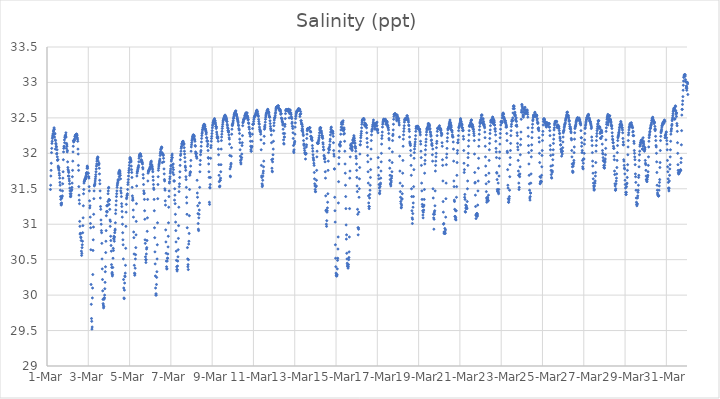
| Category | Salinity (ppt) |
|---|---|
| 44986.166666666664 | 31.49 |
| 44986.177083333336 | 31.55 |
| 44986.1875 | 31.68 |
| 44986.197916666664 | 31.76 |
| 44986.208333333336 | 31.86 |
| 44986.21875 | 32.01 |
| 44986.229166666664 | 32.07 |
| 44986.239583333336 | 32.14 |
| 44986.25 | 32.17 |
| 44986.260416666664 | 32.21 |
| 44986.270833333336 | 32.23 |
| 44986.28125 | 32.25 |
| 44986.291666666664 | 32.27 |
| 44986.302083333336 | 32.28 |
| 44986.3125 | 32.31 |
| 44986.322916666664 | 32.32 |
| 44986.333333333336 | 32.34 |
| 44986.34375 | 32.36 |
| 44986.354166666664 | 32.34 |
| 44986.364583333336 | 32.23 |
| 44986.375 | 32.27 |
| 44986.385416666664 | 32.28 |
| 44986.395833333336 | 32.19 |
| 44986.40625 | 32.06 |
| 44986.416666666664 | 32.18 |
| 44986.427083333336 | 32.14 |
| 44986.4375 | 32.13 |
| 44986.447916666664 | 32.1 |
| 44986.458333333336 | 32.09 |
| 44986.46875 | 31.99 |
| 44986.479166666664 | 32 |
| 44986.489583333336 | 32.05 |
| 44986.5 | 31.95 |
| 44986.510416666664 | 31.9 |
| 44986.520833333336 | 31.91 |
| 44986.53125 | 31.91 |
| 44986.541666666664 | 31.82 |
| 44986.552083333336 | 31.8 |
| 44986.5625 | 31.78 |
| 44986.572916666664 | 31.8 |
| 44986.583333333336 | 31.76 |
| 44986.59375 | 31.72 |
| 44986.604166666664 | 31.69 |
| 44986.614583333336 | 31.65 |
| 44986.625 | 31.59 |
| 44986.635416666664 | 31.55 |
| 44986.645833333336 | 31.48 |
| 44986.65625 | 31.39 |
| 44986.666666666664 | 31.35 |
| 44986.677083333336 | 31.29 |
| 44986.6875 | 31.27 |
| 44986.697916666664 | 31.28 |
| 44986.708333333336 | 31.3 |
| 44986.71875 | 31.37 |
| 44986.729166666664 | 31.39 |
| 44986.739583333336 | 31.4 |
| 44986.75 | 31.47 |
| 44986.760416666664 | 31.57 |
| 44986.770833333336 | 31.65 |
| 44986.78125 | 31.74 |
| 44986.791666666664 | 31.91 |
| 44986.802083333336 | 32.02 |
| 44986.8125 | 32.07 |
| 44986.822916666664 | 32.1 |
| 44986.833333333336 | 32.09 |
| 44986.84375 | 32.19 |
| 44986.854166666664 | 32.15 |
| 44986.864583333336 | 32.23 |
| 44986.875 | 32.22 |
| 44986.885416666664 | 32.25 |
| 44986.895833333336 | 32.24 |
| 44986.90625 | 32.26 |
| 44986.916666666664 | 32.29 |
| 44986.927083333336 | 32.23 |
| 44986.9375 | 32.07 |
| 44986.947916666664 | 32.14 |
| 44986.958333333336 | 32.12 |
| 44986.96875 | 32.1 |
| 44986.979166666664 | 32.02 |
| 44986.989583333336 | 32.04 |
| 44987.0 | 31.88 |
| 44987.010416666664 | 31.8 |
| 44987.020833333336 | 31.77 |
| 44987.03125 | 31.68 |
| 44987.041666666664 | 31.75 |
| 44987.052083333336 | 31.73 |
| 44987.0625 | 31.68 |
| 44987.072916666664 | 31.64 |
| 44987.083333333336 | 31.61 |
| 44987.09375 | 31.57 |
| 44987.104166666664 | 31.51 |
| 44987.114583333336 | 31.47 |
| 44987.125 | 31.43 |
| 44987.135416666664 | 31.39 |
| 44987.145833333336 | 31.39 |
| 44987.15625 | 31.4 |
| 44987.166666666664 | 31.43 |
| 44987.177083333336 | 31.47 |
| 44987.1875 | 31.48 |
| 44987.197916666664 | 31.49 |
| 44987.208333333336 | 31.52 |
| 44987.21875 | 31.58 |
| 44987.229166666664 | 31.67 |
| 44987.239583333336 | 31.76 |
| 44987.25 | 31.89 |
| 44987.260416666664 | 32.02 |
| 44987.270833333336 | 32.1 |
| 44987.28125 | 32.18 |
| 44987.291666666664 | 32.16 |
| 44987.302083333336 | 32.17 |
| 44987.3125 | 32.18 |
| 44987.322916666664 | 32.18 |
| 44987.333333333336 | 32.19 |
| 44987.34375 | 32.21 |
| 44987.354166666664 | 32.24 |
| 44987.364583333336 | 32.24 |
| 44987.375 | 32.25 |
| 44987.385416666664 | 32.26 |
| 44987.395833333336 | 32.26 |
| 44987.40625 | 32.26 |
| 44987.416666666664 | 32.27 |
| 44987.427083333336 | 32.27 |
| 44987.4375 | 32.23 |
| 44987.447916666664 | 32.27 |
| 44987.458333333336 | 32.25 |
| 44987.46875 | 32.22 |
| 44987.479166666664 | 32.2 |
| 44987.489583333336 | 32.17 |
| 44987.5 | 32.06 |
| 44987.510416666664 | 31.99 |
| 44987.520833333336 | 31.83 |
| 44987.53125 | 31.76 |
| 44987.541666666664 | 31.53 |
| 44987.552083333336 | 31.41 |
| 44987.5625 | 31.34 |
| 44987.572916666664 | 31.29 |
| 44987.583333333336 | 31.04 |
| 44987.59375 | 30.97 |
| 44987.604166666664 | 30.86 |
| 44987.614583333336 | 30.87 |
| 44987.625 | 30.87 |
| 44987.635416666664 | 30.82 |
| 44987.645833333336 | 30.81 |
| 44987.65625 | 30.77 |
| 44987.666666666664 | 30.62 |
| 44987.677083333336 | 30.56 |
| 44987.6875 | 30.59 |
| 44987.697916666664 | 30.67 |
| 44987.708333333336 | 30.71 |
| 44987.71875 | 30.76 |
| 44987.729166666664 | 30.88 |
| 44987.739583333336 | 30.98 |
| 44987.75 | 31.09 |
| 44987.760416666664 | 31.26 |
| 44987.770833333336 | 31.43 |
| 44987.78125 | 31.49 |
| 44987.791666666664 | 31.58 |
| 44987.802083333336 | 31.6 |
| 44987.8125 | 31.61 |
| 44987.822916666664 | 31.62 |
| 44987.833333333336 | 31.63 |
| 44987.84375 | 31.64 |
| 44987.854166666664 | 31.64 |
| 44987.864583333336 | 31.66 |
| 44987.875 | 31.64 |
| 44987.885416666664 | 31.67 |
| 44987.895833333336 | 31.69 |
| 44987.90625 | 31.72 |
| 44987.916666666664 | 31.71 |
| 44987.927083333336 | 31.73 |
| 44987.9375 | 31.79 |
| 44987.947916666664 | 31.82 |
| 44987.958333333336 | 31.81 |
| 44987.96875 | 31.79 |
| 44987.979166666664 | 31.72 |
| 44987.989583333336 | 31.72 |
| 44988.0 | 31.72 |
| 44988.010416666664 | 31.67 |
| 44988.020833333336 | 31.67 |
| 44988.03125 | 31.65 |
| 44988.041666666664 | 31.53 |
| 44988.052083333336 | 31.47 |
| 44988.0625 | 31.33 |
| 44988.072916666664 | 31.23 |
| 44988.083333333336 | 31.26 |
| 44988.09375 | 31.1 |
| 44988.104166666664 | 31.01 |
| 44988.114583333336 | 30.95 |
| 44988.125 | 30.64 |
| 44988.135416666664 | 30.15 |
| 44988.145833333336 | 29.87 |
| 44988.15625 | 29.67 |
| 44988.166666666664 | 29.63 |
| 44988.177083333336 | 29.52 |
| 44988.1875 | 29.55 |
| 44988.197916666664 | 29.96 |
| 44988.208333333336 | 30.1 |
| 44988.21875 | 30.29 |
| 44988.229166666664 | 30.63 |
| 44988.239583333336 | 30.78 |
| 44988.25 | 30.96 |
| 44988.260416666664 | 31.14 |
| 44988.270833333336 | 31.36 |
| 44988.28125 | 31.47 |
| 44988.291666666664 | 31.54 |
| 44988.302083333336 | 31.55 |
| 44988.3125 | 31.56 |
| 44988.322916666664 | 31.58 |
| 44988.333333333336 | 31.61 |
| 44988.34375 | 31.64 |
| 44988.354166666664 | 31.67 |
| 44988.364583333336 | 31.7 |
| 44988.375 | 31.74 |
| 44988.385416666664 | 31.78 |
| 44988.395833333336 | 31.82 |
| 44988.40625 | 31.85 |
| 44988.416666666664 | 31.89 |
| 44988.427083333336 | 31.92 |
| 44988.4375 | 31.93 |
| 44988.447916666664 | 31.92 |
| 44988.458333333336 | 31.95 |
| 44988.46875 | 31.94 |
| 44988.479166666664 | 31.89 |
| 44988.489583333336 | 31.84 |
| 44988.5 | 31.85 |
| 44988.510416666664 | 31.84 |
| 44988.520833333336 | 31.86 |
| 44988.53125 | 31.79 |
| 44988.541666666664 | 31.71 |
| 44988.552083333336 | 31.62 |
| 44988.5625 | 31.57 |
| 44988.572916666664 | 31.47 |
| 44988.583333333336 | 31.37 |
| 44988.59375 | 31.25 |
| 44988.604166666664 | 31.21 |
| 44988.614583333336 | 31.06 |
| 44988.625 | 31 |
| 44988.635416666664 | 30.91 |
| 44988.645833333336 | 30.88 |
| 44988.65625 | 30.73 |
| 44988.666666666664 | 30.51 |
| 44988.677083333336 | 30.37 |
| 44988.6875 | 30.22 |
| 44988.697916666664 | 30.06 |
| 44988.708333333336 | 29.94 |
| 44988.71875 | 29.88 |
| 44988.729166666664 | 29.86 |
| 44988.739583333336 | 29.82 |
| 44988.75 | 29.84 |
| 44988.760416666664 | 29.94 |
| 44988.770833333336 | 29.96 |
| 44988.78125 | 29.96 |
| 44988.791666666664 | 30 |
| 44988.802083333336 | 30.09 |
| 44988.8125 | 30.18 |
| 44988.822916666664 | 30.33 |
| 44988.833333333336 | 30.4 |
| 44988.84375 | 30.6 |
| 44988.854166666664 | 30.76 |
| 44988.864583333336 | 30.91 |
| 44988.875 | 31.12 |
| 44988.885416666664 | 31.18 |
| 44988.895833333336 | 31.26 |
| 44988.90625 | 31.17 |
| 44988.916666666664 | 31.18 |
| 44988.927083333336 | 31.26 |
| 44988.9375 | 31.27 |
| 44988.947916666664 | 31.32 |
| 44988.958333333336 | 31.43 |
| 44988.96875 | 31.47 |
| 44988.979166666664 | 31.51 |
| 44988.989583333336 | 31.52 |
| 44989.0 | 31.35 |
| 44989.010416666664 | 31.28 |
| 44989.020833333336 | 31.34 |
| 44989.03125 | 31.34 |
| 44989.041666666664 | 31.21 |
| 44989.052083333336 | 31.06 |
| 44989.0625 | 30.97 |
| 44989.072916666664 | 31.04 |
| 44989.083333333336 | 30.83 |
| 44989.09375 | 30.77 |
| 44989.104166666664 | 30.7 |
| 44989.114583333336 | 30.62 |
| 44989.125 | 30.43 |
| 44989.135416666664 | 30.39 |
| 44989.145833333336 | 30.3 |
| 44989.15625 | 30.32 |
| 44989.166666666664 | 30.27 |
| 44989.177083333336 | 30.29 |
| 44989.1875 | 30.39 |
| 44989.197916666664 | 30.52 |
| 44989.208333333336 | 30.66 |
| 44989.21875 | 30.63 |
| 44989.229166666664 | 30.8 |
| 44989.239583333336 | 30.83 |
| 44989.25 | 30.79 |
| 44989.260416666664 | 30.76 |
| 44989.270833333336 | 30.82 |
| 44989.28125 | 30.88 |
| 44989.291666666664 | 30.91 |
| 44989.302083333336 | 30.93 |
| 44989.3125 | 31.02 |
| 44989.322916666664 | 31.15 |
| 44989.333333333336 | 31.2 |
| 44989.34375 | 31.27 |
| 44989.354166666664 | 31.33 |
| 44989.364583333336 | 31.39 |
| 44989.375 | 31.43 |
| 44989.385416666664 | 31.47 |
| 44989.395833333336 | 31.52 |
| 44989.40625 | 31.55 |
| 44989.416666666664 | 31.57 |
| 44989.427083333336 | 31.59 |
| 44989.4375 | 31.61 |
| 44989.447916666664 | 31.63 |
| 44989.458333333336 | 31.62 |
| 44989.46875 | 31.71 |
| 44989.479166666664 | 31.73 |
| 44989.489583333336 | 31.74 |
| 44989.5 | 31.67 |
| 44989.510416666664 | 31.76 |
| 44989.520833333336 | 31.74 |
| 44989.53125 | 31.75 |
| 44989.541666666664 | 31.72 |
| 44989.552083333336 | 31.69 |
| 44989.5625 | 31.64 |
| 44989.572916666664 | 31.47 |
| 44989.583333333336 | 31.51 |
| 44989.59375 | 31.44 |
| 44989.604166666664 | 31.39 |
| 44989.614583333336 | 31.29 |
| 44989.625 | 31.25 |
| 44989.635416666664 | 31.18 |
| 44989.645833333336 | 31.1 |
| 44989.65625 | 31 |
| 44989.666666666664 | 30.88 |
| 44989.677083333336 | 30.78 |
| 44989.6875 | 30.71 |
| 44989.697916666664 | 30.51 |
| 44989.708333333336 | 30.22 |
| 44989.71875 | 30.1 |
| 44989.729166666664 | 29.96 |
| 44989.739583333336 | 29.95 |
| 44989.75 | 30.07 |
| 44989.760416666664 | 30.17 |
| 44989.770833333336 | 30.27 |
| 44989.78125 | 30.26 |
| 44989.791666666664 | 30.31 |
| 44989.802083333336 | 30.42 |
| 44989.8125 | 30.66 |
| 44989.822916666664 | 30.97 |
| 44989.833333333336 | 31.17 |
| 44989.84375 | 31.28 |
| 44989.854166666664 | 31.36 |
| 44989.864583333336 | 31.38 |
| 44989.875 | 31.41 |
| 44989.885416666664 | 31.41 |
| 44989.895833333336 | 31.43 |
| 44989.90625 | 31.49 |
| 44989.916666666664 | 31.56 |
| 44989.927083333336 | 31.59 |
| 44989.9375 | 31.63 |
| 44989.947916666664 | 31.68 |
| 44989.958333333336 | 31.73 |
| 44989.96875 | 31.76 |
| 44989.979166666664 | 31.79 |
| 44989.989583333336 | 31.83 |
| 44990.0 | 31.87 |
| 44990.010416666664 | 31.92 |
| 44990.020833333336 | 31.94 |
| 44990.03125 | 31.88 |
| 44990.041666666664 | 31.93 |
| 44990.052083333336 | 31.91 |
| 44990.0625 | 31.9 |
| 44990.072916666664 | 31.88 |
| 44990.083333333336 | 31.82 |
| 44990.09375 | 31.77 |
| 44990.104166666664 | 31.73 |
| 44990.114583333336 | 31.66 |
| 44990.125 | 31.52 |
| 44990.135416666664 | 31.4 |
| 44990.145833333336 | 31.34 |
| 44990.15625 | 31.37 |
| 44990.166666666664 | 31.34 |
| 44990.177083333336 | 31.2 |
| 44990.1875 | 31.1 |
| 44990.197916666664 | 30.89 |
| 44990.208333333336 | 30.81 |
| 44990.21875 | 30.58 |
| 44990.229166666664 | 30.42 |
| 44990.239583333336 | 30.31 |
| 44990.25 | 30.28 |
| 44990.260416666664 | 30.3 |
| 44990.270833333336 | 30.38 |
| 44990.28125 | 30.51 |
| 44990.291666666664 | 30.57 |
| 44990.302083333336 | 30.67 |
| 44990.3125 | 30.85 |
| 44990.322916666664 | 31.04 |
| 44990.333333333336 | 31.29 |
| 44990.34375 | 31.54 |
| 44990.354166666664 | 31.68 |
| 44990.364583333336 | 31.72 |
| 44990.375 | 31.74 |
| 44990.385416666664 | 31.75 |
| 44990.395833333336 | 31.77 |
| 44990.40625 | 31.79 |
| 44990.416666666664 | 31.8 |
| 44990.427083333336 | 31.81 |
| 44990.4375 | 31.83 |
| 44990.447916666664 | 31.88 |
| 44990.458333333336 | 31.93 |
| 44990.46875 | 31.96 |
| 44990.479166666664 | 31.97 |
| 44990.489583333336 | 31.98 |
| 44990.5 | 31.99 |
| 44990.510416666664 | 31.99 |
| 44990.520833333336 | 31.99 |
| 44990.53125 | 31.99 |
| 44990.541666666664 | 31.96 |
| 44990.552083333336 | 31.9 |
| 44990.5625 | 31.96 |
| 44990.572916666664 | 31.91 |
| 44990.583333333336 | 31.88 |
| 44990.59375 | 31.87 |
| 44990.604166666664 | 31.89 |
| 44990.614583333336 | 31.87 |
| 44990.625 | 31.85 |
| 44990.635416666664 | 31.8 |
| 44990.645833333336 | 31.78 |
| 44990.65625 | 31.7 |
| 44990.666666666664 | 31.65 |
| 44990.677083333336 | 31.56 |
| 44990.6875 | 31.47 |
| 44990.697916666664 | 31.43 |
| 44990.708333333336 | 31.44 |
| 44990.71875 | 31.35 |
| 44990.729166666664 | 31.19 |
| 44990.739583333336 | 31.07 |
| 44990.75 | 30.78 |
| 44990.760416666664 | 30.73 |
| 44990.770833333336 | 30.54 |
| 44990.78125 | 30.5 |
| 44990.791666666664 | 30.46 |
| 44990.802083333336 | 30.5 |
| 44990.8125 | 30.58 |
| 44990.822916666664 | 30.65 |
| 44990.833333333336 | 30.67 |
| 44990.84375 | 30.77 |
| 44990.854166666664 | 30.9 |
| 44990.864583333336 | 31.09 |
| 44990.875 | 31.35 |
| 44990.885416666664 | 31.61 |
| 44990.895833333336 | 31.72 |
| 44990.90625 | 31.75 |
| 44990.916666666664 | 31.74 |
| 44990.927083333336 | 31.75 |
| 44990.9375 | 31.76 |
| 44990.947916666664 | 31.77 |
| 44990.958333333336 | 31.77 |
| 44990.96875 | 31.78 |
| 44990.979166666664 | 31.79 |
| 44990.989583333336 | 31.8 |
| 44991.0 | 31.81 |
| 44991.010416666664 | 31.84 |
| 44991.020833333336 | 31.86 |
| 44991.03125 | 31.88 |
| 44991.041666666664 | 31.87 |
| 44991.052083333336 | 31.89 |
| 44991.0625 | 31.82 |
| 44991.072916666664 | 31.84 |
| 44991.083333333336 | 31.81 |
| 44991.09375 | 31.82 |
| 44991.104166666664 | 31.79 |
| 44991.114583333336 | 31.77 |
| 44991.125 | 31.74 |
| 44991.135416666664 | 31.67 |
| 44991.145833333336 | 31.62 |
| 44991.15625 | 31.56 |
| 44991.166666666664 | 31.51 |
| 44991.177083333336 | 31.49 |
| 44991.1875 | 31.35 |
| 44991.197916666664 | 31.19 |
| 44991.208333333336 | 30.95 |
| 44991.21875 | 30.81 |
| 44991.229166666664 | 30.61 |
| 44991.239583333336 | 30.44 |
| 44991.25 | 30.27 |
| 44991.260416666664 | 30.1 |
| 44991.270833333336 | 30 |
| 44991.28125 | 30.02 |
| 44991.291666666664 | 30 |
| 44991.302083333336 | 30.15 |
| 44991.3125 | 30.25 |
| 44991.322916666664 | 30.33 |
| 44991.333333333336 | 30.51 |
| 44991.34375 | 30.71 |
| 44991.354166666664 | 31.02 |
| 44991.364583333336 | 31.36 |
| 44991.375 | 31.56 |
| 44991.385416666664 | 31.67 |
| 44991.395833333336 | 31.76 |
| 44991.40625 | 31.79 |
| 44991.416666666664 | 31.82 |
| 44991.427083333336 | 31.84 |
| 44991.4375 | 31.86 |
| 44991.447916666664 | 31.88 |
| 44991.458333333336 | 31.9 |
| 44991.46875 | 31.92 |
| 44991.479166666664 | 31.97 |
| 44991.489583333336 | 32 |
| 44991.5 | 32.02 |
| 44991.510416666664 | 32.05 |
| 44991.520833333336 | 32.06 |
| 44991.53125 | 32.07 |
| 44991.541666666664 | 32.08 |
| 44991.552083333336 | 32.09 |
| 44991.5625 | 32.08 |
| 44991.572916666664 | 32.01 |
| 44991.583333333336 | 31.87 |
| 44991.59375 | 31.99 |
| 44991.604166666664 | 31.98 |
| 44991.614583333336 | 31.99 |
| 44991.625 | 31.98 |
| 44991.635416666664 | 31.97 |
| 44991.645833333336 | 31.93 |
| 44991.65625 | 31.88 |
| 44991.666666666664 | 31.78 |
| 44991.677083333336 | 31.71 |
| 44991.6875 | 31.63 |
| 44991.697916666664 | 31.61 |
| 44991.708333333336 | 31.5 |
| 44991.71875 | 31.48 |
| 44991.729166666664 | 31.33 |
| 44991.739583333336 | 31.27 |
| 44991.75 | 30.92 |
| 44991.760416666664 | 30.75 |
| 44991.770833333336 | 30.59 |
| 44991.78125 | 30.48 |
| 44991.791666666664 | 30.4 |
| 44991.802083333336 | 30.37 |
| 44991.8125 | 30.37 |
| 44991.822916666664 | 30.48 |
| 44991.833333333336 | 30.52 |
| 44991.84375 | 30.52 |
| 44991.854166666664 | 30.58 |
| 44991.864583333336 | 30.68 |
| 44991.875 | 30.83 |
| 44991.885416666664 | 31.02 |
| 44991.895833333336 | 31.24 |
| 44991.90625 | 31.39 |
| 44991.916666666664 | 31.47 |
| 44991.927083333336 | 31.58 |
| 44991.9375 | 31.6 |
| 44991.947916666664 | 31.64 |
| 44991.958333333336 | 31.67 |
| 44991.96875 | 31.72 |
| 44991.979166666664 | 31.75 |
| 44991.989583333336 | 31.78 |
| 44992.0 | 31.82 |
| 44992.010416666664 | 31.83 |
| 44992.020833333336 | 31.89 |
| 44992.03125 | 31.91 |
| 44992.041666666664 | 31.94 |
| 44992.052083333336 | 31.97 |
| 44992.0625 | 31.99 |
| 44992.072916666664 | 31.94 |
| 44992.083333333336 | 31.84 |
| 44992.09375 | 31.73 |
| 44992.104166666664 | 31.8 |
| 44992.114583333336 | 31.85 |
| 44992.125 | 31.77 |
| 44992.135416666664 | 31.7 |
| 44992.145833333336 | 31.61 |
| 44992.15625 | 31.61 |
| 44992.166666666664 | 31.61 |
| 44992.177083333336 | 31.34 |
| 44992.1875 | 31.5 |
| 44992.197916666664 | 31.41 |
| 44992.208333333336 | 31.29 |
| 44992.21875 | 31.14 |
| 44992.229166666664 | 31.03 |
| 44992.239583333336 | 30.91 |
| 44992.25 | 30.75 |
| 44992.260416666664 | 30.62 |
| 44992.270833333336 | 30.49 |
| 44992.28125 | 30.4 |
| 44992.291666666664 | 30.36 |
| 44992.302083333336 | 30.34 |
| 44992.3125 | 30.36 |
| 44992.322916666664 | 30.41 |
| 44992.333333333336 | 30.48 |
| 44992.34375 | 30.54 |
| 44992.354166666664 | 30.64 |
| 44992.364583333336 | 30.8 |
| 44992.375 | 30.98 |
| 44992.385416666664 | 31.24 |
| 44992.395833333336 | 31.46 |
| 44992.40625 | 31.53 |
| 44992.416666666664 | 31.57 |
| 44992.427083333336 | 31.66 |
| 44992.4375 | 31.74 |
| 44992.447916666664 | 31.83 |
| 44992.458333333336 | 31.91 |
| 44992.46875 | 31.97 |
| 44992.479166666664 | 31.99 |
| 44992.489583333336 | 32.03 |
| 44992.5 | 32.07 |
| 44992.510416666664 | 32.09 |
| 44992.520833333336 | 32.1 |
| 44992.53125 | 32.13 |
| 44992.541666666664 | 32.14 |
| 44992.552083333336 | 32.14 |
| 44992.5625 | 32.16 |
| 44992.572916666664 | 32.16 |
| 44992.583333333336 | 32.17 |
| 44992.59375 | 32.17 |
| 44992.604166666664 | 32.12 |
| 44992.614583333336 | 32.14 |
| 44992.625 | 32.14 |
| 44992.635416666664 | 32.13 |
| 44992.645833333336 | 32.08 |
| 44992.65625 | 32.03 |
| 44992.666666666664 | 31.99 |
| 44992.677083333336 | 31.94 |
| 44992.6875 | 31.88 |
| 44992.697916666664 | 31.82 |
| 44992.708333333336 | 31.8 |
| 44992.71875 | 31.76 |
| 44992.729166666664 | 31.67 |
| 44992.739583333336 | 31.63 |
| 44992.75 | 31.52 |
| 44992.760416666664 | 31.38 |
| 44992.770833333336 | 31.3 |
| 44992.78125 | 31.14 |
| 44992.791666666664 | 30.95 |
| 44992.802083333336 | 30.67 |
| 44992.8125 | 30.51 |
| 44992.822916666664 | 30.4 |
| 44992.833333333336 | 30.43 |
| 44992.84375 | 30.36 |
| 44992.854166666664 | 30.5 |
| 44992.864583333336 | 30.72 |
| 44992.875 | 30.76 |
| 44992.885416666664 | 30.87 |
| 44992.895833333336 | 31.12 |
| 44992.90625 | 31.49 |
| 44992.916666666664 | 31.69 |
| 44992.927083333336 | 31.71 |
| 44992.9375 | 31.73 |
| 44992.947916666664 | 31.74 |
| 44992.958333333336 | 31.82 |
| 44992.96875 | 31.9 |
| 44992.979166666664 | 32.03 |
| 44992.989583333336 | 32.09 |
| 44993.0 | 32.12 |
| 44993.010416666664 | 32.15 |
| 44993.020833333336 | 32.18 |
| 44993.03125 | 32.19 |
| 44993.041666666664 | 32.21 |
| 44993.052083333336 | 32.23 |
| 44993.0625 | 32.24 |
| 44993.072916666664 | 32.25 |
| 44993.083333333336 | 32.26 |
| 44993.09375 | 32.26 |
| 44993.104166666664 | 32.23 |
| 44993.114583333336 | 32.22 |
| 44993.125 | 32.25 |
| 44993.135416666664 | 32.24 |
| 44993.145833333336 | 32.2 |
| 44993.15625 | 32.19 |
| 44993.166666666664 | 32.17 |
| 44993.177083333336 | 32.11 |
| 44993.1875 | 32.1 |
| 44993.197916666664 | 32.02 |
| 44993.208333333336 | 32 |
| 44993.21875 | 31.99 |
| 44993.229166666664 | 31.96 |
| 44993.239583333336 | 32 |
| 44993.25 | 31.95 |
| 44993.260416666664 | 31.93 |
| 44993.270833333336 | 31.62 |
| 44993.28125 | 31.44 |
| 44993.291666666664 | 31.38 |
| 44993.302083333336 | 31.26 |
| 44993.3125 | 31.15 |
| 44993.322916666664 | 31.01 |
| 44993.333333333336 | 30.93 |
| 44993.34375 | 30.91 |
| 44993.354166666664 | 31.09 |
| 44993.364583333336 | 31.14 |
| 44993.375 | 31.2 |
| 44993.385416666664 | 31.3 |
| 44993.395833333336 | 31.52 |
| 44993.40625 | 31.74 |
| 44993.416666666664 | 31.84 |
| 44993.427083333336 | 31.9 |
| 44993.4375 | 31.98 |
| 44993.447916666664 | 32.02 |
| 44993.458333333336 | 32.04 |
| 44993.46875 | 32.1 |
| 44993.479166666664 | 32.16 |
| 44993.489583333336 | 32.21 |
| 44993.5 | 32.25 |
| 44993.510416666664 | 32.28 |
| 44993.520833333336 | 32.3 |
| 44993.53125 | 32.33 |
| 44993.541666666664 | 32.34 |
| 44993.552083333336 | 32.36 |
| 44993.5625 | 32.37 |
| 44993.572916666664 | 32.39 |
| 44993.583333333336 | 32.38 |
| 44993.59375 | 32.39 |
| 44993.604166666664 | 32.41 |
| 44993.614583333336 | 32.41 |
| 44993.625 | 32.4 |
| 44993.635416666664 | 32.35 |
| 44993.645833333336 | 32.4 |
| 44993.65625 | 32.38 |
| 44993.666666666664 | 32.35 |
| 44993.677083333336 | 32.34 |
| 44993.6875 | 32.32 |
| 44993.697916666664 | 32.31 |
| 44993.708333333336 | 32.27 |
| 44993.71875 | 32.29 |
| 44993.729166666664 | 32.22 |
| 44993.739583333336 | 32.22 |
| 44993.75 | 32.17 |
| 44993.760416666664 | 32.18 |
| 44993.770833333336 | 32.1 |
| 44993.78125 | 32.17 |
| 44993.791666666664 | 32.13 |
| 44993.802083333336 | 32.04 |
| 44993.8125 | 31.94 |
| 44993.822916666664 | 31.93 |
| 44993.833333333336 | 31.85 |
| 44993.84375 | 31.74 |
| 44993.854166666664 | 31.66 |
| 44993.864583333336 | 31.31 |
| 44993.875 | 31.28 |
| 44993.885416666664 | 31.52 |
| 44993.895833333336 | 31.51 |
| 44993.90625 | 31.56 |
| 44993.916666666664 | 31.66 |
| 44993.927083333336 | 31.93 |
| 44993.9375 | 32.08 |
| 44993.947916666664 | 32.11 |
| 44993.958333333336 | 32.17 |
| 44993.96875 | 32.21 |
| 44993.979166666664 | 32.24 |
| 44993.989583333336 | 32.28 |
| 44994.0 | 32.32 |
| 44994.010416666664 | 32.36 |
| 44994.020833333336 | 32.39 |
| 44994.03125 | 32.41 |
| 44994.041666666664 | 32.43 |
| 44994.052083333336 | 32.44 |
| 44994.0625 | 32.45 |
| 44994.072916666664 | 32.46 |
| 44994.083333333336 | 32.47 |
| 44994.09375 | 32.47 |
| 44994.104166666664 | 32.48 |
| 44994.114583333336 | 32.49 |
| 44994.125 | 32.45 |
| 44994.135416666664 | 32.43 |
| 44994.145833333336 | 32.46 |
| 44994.15625 | 32.43 |
| 44994.166666666664 | 32.41 |
| 44994.177083333336 | 32.38 |
| 44994.1875 | 32.38 |
| 44994.197916666664 | 32.35 |
| 44994.208333333336 | 32.37 |
| 44994.21875 | 32.3 |
| 44994.229166666664 | 32.27 |
| 44994.239583333336 | 32.22 |
| 44994.25 | 32.24 |
| 44994.260416666664 | 32.22 |
| 44994.270833333336 | 32.21 |
| 44994.28125 | 32.23 |
| 44994.291666666664 | 32.17 |
| 44994.302083333336 | 32.06 |
| 44994.3125 | 31.98 |
| 44994.322916666664 | 31.84 |
| 44994.333333333336 | 31.69 |
| 44994.34375 | 31.6 |
| 44994.354166666664 | 31.53 |
| 44994.364583333336 | 31.53 |
| 44994.375 | 31.54 |
| 44994.385416666664 | 31.62 |
| 44994.395833333336 | 31.62 |
| 44994.40625 | 31.65 |
| 44994.416666666664 | 31.74 |
| 44994.427083333336 | 31.84 |
| 44994.4375 | 32.06 |
| 44994.447916666664 | 32.18 |
| 44994.458333333336 | 32.23 |
| 44994.46875 | 32.27 |
| 44994.479166666664 | 32.31 |
| 44994.489583333336 | 32.35 |
| 44994.5 | 32.38 |
| 44994.510416666664 | 32.41 |
| 44994.520833333336 | 32.44 |
| 44994.53125 | 32.46 |
| 44994.541666666664 | 32.47 |
| 44994.552083333336 | 32.48 |
| 44994.5625 | 32.49 |
| 44994.572916666664 | 32.5 |
| 44994.583333333336 | 32.51 |
| 44994.59375 | 32.52 |
| 44994.604166666664 | 32.52 |
| 44994.614583333336 | 32.53 |
| 44994.625 | 32.54 |
| 44994.635416666664 | 32.53 |
| 44994.645833333336 | 32.48 |
| 44994.65625 | 32.48 |
| 44994.666666666664 | 32.51 |
| 44994.677083333336 | 32.51 |
| 44994.6875 | 32.49 |
| 44994.697916666664 | 32.48 |
| 44994.708333333336 | 32.45 |
| 44994.71875 | 32.45 |
| 44994.729166666664 | 32.41 |
| 44994.739583333336 | 32.39 |
| 44994.75 | 32.36 |
| 44994.760416666664 | 32.32 |
| 44994.770833333336 | 32.35 |
| 44994.78125 | 32.3 |
| 44994.791666666664 | 32.32 |
| 44994.802083333336 | 32.3 |
| 44994.8125 | 32.26 |
| 44994.822916666664 | 32.22 |
| 44994.833333333336 | 32.2 |
| 44994.84375 | 32.13 |
| 44994.854166666664 | 31.97 |
| 44994.864583333336 | 31.78 |
| 44994.875 | 31.68 |
| 44994.885416666664 | 31.67 |
| 44994.895833333336 | 31.81 |
| 44994.90625 | 31.84 |
| 44994.916666666664 | 31.86 |
| 44994.927083333336 | 31.96 |
| 44994.9375 | 32.08 |
| 44994.947916666664 | 32.27 |
| 44994.958333333336 | 32.34 |
| 44994.96875 | 32.4 |
| 44994.979166666664 | 32.39 |
| 44994.989583333336 | 32.41 |
| 44995.0 | 32.42 |
| 44995.010416666664 | 32.44 |
| 44995.020833333336 | 32.46 |
| 44995.03125 | 32.49 |
| 44995.041666666664 | 32.5 |
| 44995.052083333336 | 32.52 |
| 44995.0625 | 32.54 |
| 44995.072916666664 | 32.55 |
| 44995.083333333336 | 32.56 |
| 44995.09375 | 32.57 |
| 44995.104166666664 | 32.57 |
| 44995.114583333336 | 32.58 |
| 44995.125 | 32.59 |
| 44995.135416666664 | 32.59 |
| 44995.145833333336 | 32.6 |
| 44995.15625 | 32.56 |
| 44995.166666666664 | 32.54 |
| 44995.177083333336 | 32.55 |
| 44995.1875 | 32.54 |
| 44995.197916666664 | 32.52 |
| 44995.208333333336 | 32.49 |
| 44995.21875 | 32.5 |
| 44995.229166666664 | 32.48 |
| 44995.239583333336 | 32.46 |
| 44995.25 | 32.45 |
| 44995.260416666664 | 32.43 |
| 44995.270833333336 | 32.4 |
| 44995.28125 | 32.39 |
| 44995.291666666664 | 32.35 |
| 44995.302083333336 | 32.33 |
| 44995.3125 | 32.33 |
| 44995.322916666664 | 32.28 |
| 44995.333333333336 | 32.2 |
| 44995.34375 | 32.15 |
| 44995.354166666664 | 32.05 |
| 44995.364583333336 | 31.96 |
| 44995.375 | 31.9 |
| 44995.385416666664 | 31.87 |
| 44995.395833333336 | 31.85 |
| 44995.40625 | 31.91 |
| 44995.416666666664 | 31.94 |
| 44995.427083333336 | 31.94 |
| 44995.4375 | 31.99 |
| 44995.447916666664 | 32.11 |
| 44995.458333333336 | 32.15 |
| 44995.46875 | 32.25 |
| 44995.479166666664 | 32.39 |
| 44995.489583333336 | 32.43 |
| 44995.5 | 32.44 |
| 44995.510416666664 | 32.45 |
| 44995.520833333336 | 32.47 |
| 44995.53125 | 32.48 |
| 44995.541666666664 | 32.48 |
| 44995.552083333336 | 32.49 |
| 44995.5625 | 32.49 |
| 44995.572916666664 | 32.51 |
| 44995.583333333336 | 32.53 |
| 44995.59375 | 32.54 |
| 44995.604166666664 | 32.54 |
| 44995.614583333336 | 32.55 |
| 44995.625 | 32.56 |
| 44995.635416666664 | 32.57 |
| 44995.645833333336 | 32.57 |
| 44995.65625 | 32.57 |
| 44995.666666666664 | 32.54 |
| 44995.677083333336 | 32.5 |
| 44995.6875 | 32.51 |
| 44995.697916666664 | 32.57 |
| 44995.708333333336 | 32.53 |
| 44995.71875 | 32.5 |
| 44995.729166666664 | 32.51 |
| 44995.739583333336 | 32.47 |
| 44995.75 | 32.48 |
| 44995.760416666664 | 32.43 |
| 44995.770833333336 | 32.42 |
| 44995.78125 | 32.37 |
| 44995.791666666664 | 32.37 |
| 44995.802083333336 | 32.34 |
| 44995.8125 | 32.29 |
| 44995.822916666664 | 32.29 |
| 44995.833333333336 | 32.27 |
| 44995.84375 | 32.24 |
| 44995.854166666664 | 32.17 |
| 44995.864583333336 | 32.1 |
| 44995.875 | 32.05 |
| 44995.885416666664 | 32.03 |
| 44995.895833333336 | 32.03 |
| 44995.90625 | 32.08 |
| 44995.916666666664 | 32.09 |
| 44995.927083333336 | 32.1 |
| 44995.9375 | 32.17 |
| 44995.947916666664 | 32.27 |
| 44995.958333333336 | 32.35 |
| 44995.96875 | 32.41 |
| 44995.979166666664 | 32.41 |
| 44995.989583333336 | 32.41 |
| 44996.0 | 32.42 |
| 44996.010416666664 | 32.45 |
| 44996.020833333336 | 32.48 |
| 44996.03125 | 32.5 |
| 44996.041666666664 | 32.51 |
| 44996.052083333336 | 32.52 |
| 44996.0625 | 32.52 |
| 44996.072916666664 | 32.53 |
| 44996.083333333336 | 32.53 |
| 44996.09375 | 32.54 |
| 44996.104166666664 | 32.55 |
| 44996.114583333336 | 32.56 |
| 44996.125 | 32.58 |
| 44996.135416666664 | 32.58 |
| 44996.145833333336 | 32.6 |
| 44996.15625 | 32.6 |
| 44996.166666666664 | 32.61 |
| 44996.177083333336 | 32.58 |
| 44996.1875 | 32.54 |
| 44996.197916666664 | 32.59 |
| 44996.208333333336 | 32.56 |
| 44996.21875 | 32.54 |
| 44996.229166666664 | 32.53 |
| 44996.239583333336 | 32.52 |
| 44996.25 | 32.48 |
| 44996.260416666664 | 32.45 |
| 44996.270833333336 | 32.42 |
| 44996.28125 | 32.41 |
| 44996.291666666664 | 32.37 |
| 44996.302083333336 | 32.34 |
| 44996.3125 | 32.33 |
| 44996.322916666664 | 32.31 |
| 44996.333333333336 | 32.32 |
| 44996.34375 | 32.3 |
| 44996.354166666664 | 32.27 |
| 44996.364583333336 | 32.19 |
| 44996.375 | 32.05 |
| 44996.385416666664 | 31.83 |
| 44996.395833333336 | 31.68 |
| 44996.40625 | 31.66 |
| 44996.416666666664 | 31.57 |
| 44996.427083333336 | 31.53 |
| 44996.4375 | 31.55 |
| 44996.447916666664 | 31.62 |
| 44996.458333333336 | 31.68 |
| 44996.46875 | 31.72 |
| 44996.479166666664 | 31.75 |
| 44996.489583333336 | 31.81 |
| 44996.5 | 31.89 |
| 44996.510416666664 | 32.14 |
| 44996.520833333336 | 32.24 |
| 44996.53125 | 32.34 |
| 44996.541666666664 | 32.38 |
| 44996.552083333336 | 32.36 |
| 44996.5625 | 32.4 |
| 44996.572916666664 | 32.44 |
| 44996.583333333336 | 32.48 |
| 44996.59375 | 32.51 |
| 44996.604166666664 | 32.53 |
| 44996.614583333336 | 32.55 |
| 44996.625 | 32.56 |
| 44996.635416666664 | 32.57 |
| 44996.645833333336 | 32.58 |
| 44996.65625 | 32.6 |
| 44996.666666666664 | 32.58 |
| 44996.677083333336 | 32.59 |
| 44996.6875 | 32.62 |
| 44996.697916666664 | 32.62 |
| 44996.708333333336 | 32.59 |
| 44996.71875 | 32.59 |
| 44996.729166666664 | 32.59 |
| 44996.739583333336 | 32.58 |
| 44996.75 | 32.57 |
| 44996.760416666664 | 32.54 |
| 44996.770833333336 | 32.52 |
| 44996.78125 | 32.51 |
| 44996.791666666664 | 32.51 |
| 44996.802083333336 | 32.46 |
| 44996.8125 | 32.42 |
| 44996.822916666664 | 32.38 |
| 44996.833333333336 | 32.35 |
| 44996.84375 | 32.34 |
| 44996.854166666664 | 32.32 |
| 44996.864583333336 | 32.26 |
| 44996.875 | 32.15 |
| 44996.885416666664 | 31.91 |
| 44996.895833333336 | 31.79 |
| 44996.90625 | 31.75 |
| 44996.916666666664 | 31.74 |
| 44996.927083333336 | 31.88 |
| 44996.9375 | 31.92 |
| 44996.947916666664 | 31.98 |
| 44996.958333333336 | 32.06 |
| 44996.96875 | 32.17 |
| 44996.979166666664 | 32.32 |
| 44996.989583333336 | 32.39 |
| 44997.0 | 32.43 |
| 44997.010416666664 | 32.47 |
| 44997.020833333336 | 32.5 |
| 44997.03125 | 32.5 |
| 44997.041666666664 | 32.51 |
| 44997.052083333336 | 32.53 |
| 44997.0625 | 32.56 |
| 44997.072916666664 | 32.58 |
| 44997.083333333336 | 32.61 |
| 44997.09375 | 32.63 |
| 44997.104166666664 | 32.65 |
| 44997.114583333336 | 32.65 |
| 44997.125 | 32.65 |
| 44997.135416666664 | 32.65 |
| 44997.145833333336 | 32.65 |
| 44997.15625 | 32.66 |
| 44997.166666666664 | 32.66 |
| 44997.177083333336 | 32.66 |
| 44997.1875 | 32.67 |
| 44997.197916666664 | 32.67 |
| 44997.208333333336 | 32.67 |
| 44997.21875 | 32.64 |
| 44997.229166666664 | 32.63 |
| 44997.239583333336 | 32.63 |
| 44997.25 | 32.62 |
| 44997.260416666664 | 32.62 |
| 44997.270833333336 | 32.6 |
| 44997.28125 | 32.62 |
| 44997.291666666664 | 32.6 |
| 44997.302083333336 | 32.61 |
| 44997.3125 | 32.59 |
| 44997.322916666664 | 32.55 |
| 44997.333333333336 | 32.56 |
| 44997.34375 | 32.56 |
| 44997.354166666664 | 32.5 |
| 44997.364583333336 | 32.49 |
| 44997.375 | 32.49 |
| 44997.385416666664 | 32.47 |
| 44997.395833333336 | 32.45 |
| 44997.40625 | 32.44 |
| 44997.416666666664 | 32.4 |
| 44997.427083333336 | 32.42 |
| 44997.4375 | 32.34 |
| 44997.447916666664 | 32.28 |
| 44997.458333333336 | 32.19 |
| 44997.46875 | 32.14 |
| 44997.479166666664 | 32.13 |
| 44997.489583333336 | 32.23 |
| 44997.5 | 32.23 |
| 44997.510416666664 | 32.28 |
| 44997.520833333336 | 32.38 |
| 44997.53125 | 32.41 |
| 44997.541666666664 | 32.49 |
| 44997.552083333336 | 32.56 |
| 44997.5625 | 32.6 |
| 44997.572916666664 | 32.61 |
| 44997.583333333336 | 32.62 |
| 44997.59375 | 32.61 |
| 44997.604166666664 | 32.61 |
| 44997.614583333336 | 32.61 |
| 44997.625 | 32.6 |
| 44997.635416666664 | 32.6 |
| 44997.645833333336 | 32.6 |
| 44997.65625 | 32.61 |
| 44997.666666666664 | 32.61 |
| 44997.677083333336 | 32.62 |
| 44997.6875 | 32.62 |
| 44997.697916666664 | 32.62 |
| 44997.708333333336 | 32.62 |
| 44997.71875 | 32.59 |
| 44997.729166666664 | 32.5 |
| 44997.739583333336 | 32.58 |
| 44997.75 | 32.56 |
| 44997.760416666664 | 32.58 |
| 44997.770833333336 | 32.61 |
| 44997.78125 | 32.61 |
| 44997.791666666664 | 32.57 |
| 44997.802083333336 | 32.57 |
| 44997.8125 | 32.57 |
| 44997.822916666664 | 32.55 |
| 44997.833333333336 | 32.52 |
| 44997.84375 | 32.5 |
| 44997.854166666664 | 32.49 |
| 44997.864583333336 | 32.42 |
| 44997.875 | 32.44 |
| 44997.885416666664 | 32.38 |
| 44997.895833333336 | 32.38 |
| 44997.90625 | 32.35 |
| 44997.916666666664 | 32.29 |
| 44997.927083333336 | 32.21 |
| 44997.9375 | 32.11 |
| 44997.947916666664 | 32.03 |
| 44997.958333333336 | 32.01 |
| 44997.96875 | 32.05 |
| 44997.979166666664 | 32.13 |
| 44997.989583333336 | 32.15 |
| 44998.0 | 32.17 |
| 44998.010416666664 | 32.27 |
| 44998.020833333336 | 32.37 |
| 44998.03125 | 32.43 |
| 44998.041666666664 | 32.49 |
| 44998.052083333336 | 32.52 |
| 44998.0625 | 32.54 |
| 44998.072916666664 | 32.56 |
| 44998.083333333336 | 32.58 |
| 44998.09375 | 32.59 |
| 44998.104166666664 | 32.59 |
| 44998.114583333336 | 32.6 |
| 44998.125 | 32.6 |
| 44998.135416666664 | 32.6 |
| 44998.145833333336 | 32.61 |
| 44998.15625 | 32.6 |
| 44998.166666666664 | 32.61 |
| 44998.177083333336 | 32.63 |
| 44998.1875 | 32.62 |
| 44998.197916666664 | 32.63 |
| 44998.208333333336 | 32.62 |
| 44998.21875 | 32.62 |
| 44998.229166666664 | 32.62 |
| 44998.239583333336 | 32.62 |
| 44998.25 | 32.52 |
| 44998.260416666664 | 32.55 |
| 44998.270833333336 | 32.55 |
| 44998.28125 | 32.59 |
| 44998.291666666664 | 32.56 |
| 44998.302083333336 | 32.46 |
| 44998.3125 | 32.46 |
| 44998.322916666664 | 32.43 |
| 44998.333333333336 | 32.41 |
| 44998.34375 | 32.32 |
| 44998.354166666664 | 32.41 |
| 44998.364583333336 | 32.35 |
| 44998.375 | 32.38 |
| 44998.385416666664 | 32.33 |
| 44998.395833333336 | 32.3 |
| 44998.40625 | 32.27 |
| 44998.416666666664 | 32.25 |
| 44998.427083333336 | 32.18 |
| 44998.4375 | 32.13 |
| 44998.447916666664 | 32.11 |
| 44998.458333333336 | 32.13 |
| 44998.46875 | 32.07 |
| 44998.479166666664 | 32.04 |
| 44998.489583333336 | 32.01 |
| 44998.5 | 32 |
| 44998.510416666664 | 31.99 |
| 44998.520833333336 | 31.92 |
| 44998.53125 | 31.99 |
| 44998.541666666664 | 31.99 |
| 44998.552083333336 | 32 |
| 44998.5625 | 32.09 |
| 44998.572916666664 | 32.12 |
| 44998.583333333336 | 32.21 |
| 44998.59375 | 32.27 |
| 44998.604166666664 | 32.32 |
| 44998.614583333336 | 32.34 |
| 44998.625 | 32.35 |
| 44998.635416666664 | 32.35 |
| 44998.645833333336 | 32.35 |
| 44998.65625 | 32.34 |
| 44998.666666666664 | 32.35 |
| 44998.677083333336 | 32.35 |
| 44998.6875 | 32.35 |
| 44998.697916666664 | 32.35 |
| 44998.708333333336 | 32.36 |
| 44998.71875 | 32.36 |
| 44998.729166666664 | 32.36 |
| 44998.739583333336 | 32.36 |
| 44998.75 | 32.31 |
| 44998.760416666664 | 32.31 |
| 44998.770833333336 | 32.24 |
| 44998.78125 | 32.3 |
| 44998.791666666664 | 32.24 |
| 44998.802083333336 | 32.2 |
| 44998.8125 | 32.2 |
| 44998.822916666664 | 32.2 |
| 44998.833333333336 | 32.22 |
| 44998.84375 | 32.18 |
| 44998.854166666664 | 32.11 |
| 44998.864583333336 | 32.07 |
| 44998.875 | 32.03 |
| 44998.885416666664 | 31.98 |
| 44998.895833333336 | 31.94 |
| 44998.90625 | 31.92 |
| 44998.916666666664 | 31.9 |
| 44998.927083333336 | 31.86 |
| 44998.9375 | 31.83 |
| 44998.947916666664 | 31.73 |
| 44998.958333333336 | 31.64 |
| 44998.96875 | 31.57 |
| 44998.979166666664 | 31.54 |
| 44998.989583333336 | 31.49 |
| 44999.0 | 31.46 |
| 44999.010416666664 | 31.46 |
| 44999.020833333336 | 31.54 |
| 44999.03125 | 31.53 |
| 44999.041666666664 | 31.54 |
| 44999.052083333336 | 31.62 |
| 44999.0625 | 31.76 |
| 44999.072916666664 | 31.95 |
| 44999.083333333336 | 32.03 |
| 44999.09375 | 32.15 |
| 44999.104166666664 | 32.14 |
| 44999.114583333336 | 32.14 |
| 44999.125 | 32.14 |
| 44999.135416666664 | 32.14 |
| 44999.145833333336 | 32.16 |
| 44999.15625 | 32.18 |
| 44999.166666666664 | 32.2 |
| 44999.177083333336 | 32.22 |
| 44999.1875 | 32.25 |
| 44999.197916666664 | 32.29 |
| 44999.208333333336 | 32.33 |
| 44999.21875 | 32.35 |
| 44999.229166666664 | 32.36 |
| 44999.239583333336 | 32.36 |
| 44999.25 | 32.36 |
| 44999.260416666664 | 32.36 |
| 44999.270833333336 | 32.31 |
| 44999.28125 | 32.32 |
| 44999.291666666664 | 32.3 |
| 44999.302083333336 | 32.28 |
| 44999.3125 | 32.25 |
| 44999.322916666664 | 32.23 |
| 44999.333333333336 | 32.25 |
| 44999.34375 | 32.23 |
| 44999.354166666664 | 32.21 |
| 44999.364583333336 | 32.15 |
| 44999.375 | 32.13 |
| 44999.385416666664 | 32.09 |
| 44999.395833333336 | 32.05 |
| 44999.40625 | 32.05 |
| 44999.416666666664 | 31.97 |
| 44999.427083333336 | 31.96 |
| 44999.4375 | 31.92 |
| 44999.447916666664 | 31.93 |
| 44999.458333333336 | 31.93 |
| 44999.46875 | 31.88 |
| 44999.479166666664 | 31.74 |
| 44999.489583333336 | 31.65 |
| 44999.5 | 31.4 |
| 44999.510416666664 | 31.19 |
| 44999.520833333336 | 31.2 |
| 44999.53125 | 31 |
| 44999.541666666664 | 30.97 |
| 44999.552083333336 | 31.05 |
| 44999.5625 | 31.17 |
| 44999.572916666664 | 31.19 |
| 44999.583333333336 | 31.23 |
| 44999.59375 | 31.31 |
| 44999.604166666664 | 31.43 |
| 44999.614583333336 | 31.76 |
| 44999.625 | 31.89 |
| 44999.635416666664 | 32.01 |
| 44999.645833333336 | 32.07 |
| 44999.65625 | 32.06 |
| 44999.666666666664 | 32.05 |
| 44999.677083333336 | 32.05 |
| 44999.6875 | 32.09 |
| 44999.697916666664 | 32.12 |
| 44999.708333333336 | 32.17 |
| 44999.71875 | 32.2 |
| 44999.729166666664 | 32.26 |
| 44999.739583333336 | 32.3 |
| 44999.75 | 32.34 |
| 44999.760416666664 | 32.36 |
| 44999.770833333336 | 32.37 |
| 44999.78125 | 32.3 |
| 44999.791666666664 | 32.31 |
| 44999.802083333336 | 32.32 |
| 44999.8125 | 32.31 |
| 44999.822916666664 | 32.31 |
| 44999.833333333336 | 32.29 |
| 44999.84375 | 32.31 |
| 44999.854166666664 | 32.28 |
| 44999.864583333336 | 32.24 |
| 44999.875 | 32.15 |
| 44999.885416666664 | 32.04 |
| 44999.895833333336 | 31.99 |
| 44999.90625 | 31.96 |
| 44999.916666666664 | 31.78 |
| 44999.927083333336 | 31.78 |
| 44999.9375 | 31.38 |
| 44999.947916666664 | 31.19 |
| 44999.958333333336 | 31.03 |
| 44999.96875 | 30.71 |
| 44999.979166666664 | 30.52 |
| 44999.989583333336 | 30.4 |
| 45000.0 | 30.31 |
| 45000.010416666664 | 30.28 |
| 45000.020833333336 | 30.27 |
| 45000.03125 | 30.28 |
| 45000.041666666664 | 30.27 |
| 45000.052083333336 | 30.29 |
| 45000.0625 | 30.37 |
| 45000.072916666664 | 30.49 |
| 45000.083333333336 | 30.52 |
| 45000.09375 | 30.65 |
| 45000.104166666664 | 30.82 |
| 45000.114583333336 | 31.3 |
| 45000.125 | 31.6 |
| 45000.135416666664 | 31.85 |
| 45000.145833333336 | 31.94 |
| 45000.15625 | 32.03 |
| 45000.166666666664 | 32.12 |
| 45000.177083333336 | 32.13 |
| 45000.1875 | 32.12 |
| 45000.197916666664 | 32.1 |
| 45000.208333333336 | 32.11 |
| 45000.21875 | 32.16 |
| 45000.229166666664 | 32.27 |
| 45000.239583333336 | 32.33 |
| 45000.25 | 32.37 |
| 45000.260416666664 | 32.41 |
| 45000.270833333336 | 32.43 |
| 45000.28125 | 32.44 |
| 45000.291666666664 | 32.44 |
| 45000.302083333336 | 32.35 |
| 45000.3125 | 32.36 |
| 45000.322916666664 | 32.41 |
| 45000.333333333336 | 32.44 |
| 45000.34375 | 32.46 |
| 45000.354166666664 | 32.32 |
| 45000.364583333336 | 32.32 |
| 45000.375 | 32.27 |
| 45000.385416666664 | 32.36 |
| 45000.395833333336 | 32.34 |
| 45000.40625 | 32.28 |
| 45000.416666666664 | 32.17 |
| 45000.427083333336 | 32.03 |
| 45000.4375 | 31.85 |
| 45000.447916666664 | 31.72 |
| 45000.458333333336 | 31.55 |
| 45000.46875 | 31.39 |
| 45000.479166666664 | 31.22 |
| 45000.489583333336 | 30.99 |
| 45000.5 | 30.79 |
| 45000.510416666664 | 30.85 |
| 45000.520833333336 | 30.59 |
| 45000.53125 | 30.51 |
| 45000.541666666664 | 30.45 |
| 45000.552083333336 | 30.41 |
| 45000.5625 | 30.43 |
| 45000.572916666664 | 30.4 |
| 45000.583333333336 | 30.38 |
| 45000.59375 | 30.4 |
| 45000.604166666664 | 30.43 |
| 45000.614583333336 | 30.5 |
| 45000.625 | 30.53 |
| 45000.635416666664 | 30.61 |
| 45000.645833333336 | 30.82 |
| 45000.65625 | 31.22 |
| 45000.666666666664 | 31.65 |
| 45000.677083333336 | 31.75 |
| 45000.6875 | 31.95 |
| 45000.697916666664 | 32.07 |
| 45000.708333333336 | 32.11 |
| 45000.71875 | 32.13 |
| 45000.729166666664 | 32.12 |
| 45000.739583333336 | 32.1 |
| 45000.75 | 32.1 |
| 45000.760416666664 | 32.07 |
| 45000.770833333336 | 32.05 |
| 45000.78125 | 32.04 |
| 45000.791666666664 | 32.09 |
| 45000.802083333336 | 32.15 |
| 45000.8125 | 32.19 |
| 45000.822916666664 | 32.18 |
| 45000.833333333336 | 32.15 |
| 45000.84375 | 32.2 |
| 45000.854166666664 | 32.22 |
| 45000.864583333336 | 32.25 |
| 45000.875 | 32.23 |
| 45000.885416666664 | 32.21 |
| 45000.895833333336 | 32.18 |
| 45000.90625 | 32.15 |
| 45000.916666666664 | 32.14 |
| 45000.927083333336 | 32.1 |
| 45000.9375 | 32.09 |
| 45000.947916666664 | 32.07 |
| 45000.958333333336 | 32.03 |
| 45000.96875 | 31.96 |
| 45000.979166666664 | 31.93 |
| 45000.989583333336 | 31.85 |
| 45001.0 | 31.76 |
| 45001.010416666664 | 31.66 |
| 45001.020833333336 | 31.54 |
| 45001.03125 | 31.46 |
| 45001.041666666664 | 31.21 |
| 45001.052083333336 | 31.14 |
| 45001.0625 | 30.95 |
| 45001.072916666664 | 30.85 |
| 45001.083333333336 | 30.95 |
| 45001.09375 | 30.93 |
| 45001.104166666664 | 31.17 |
| 45001.114583333336 | 31.38 |
| 45001.125 | 31.5 |
| 45001.135416666664 | 31.64 |
| 45001.145833333336 | 31.8 |
| 45001.15625 | 31.99 |
| 45001.166666666664 | 32.12 |
| 45001.177083333336 | 32.12 |
| 45001.1875 | 32.17 |
| 45001.197916666664 | 32.22 |
| 45001.208333333336 | 32.25 |
| 45001.21875 | 32.28 |
| 45001.229166666664 | 32.31 |
| 45001.239583333336 | 32.36 |
| 45001.25 | 32.41 |
| 45001.260416666664 | 32.44 |
| 45001.270833333336 | 32.46 |
| 45001.28125 | 32.47 |
| 45001.291666666664 | 32.48 |
| 45001.302083333336 | 32.48 |
| 45001.3125 | 32.48 |
| 45001.322916666664 | 32.48 |
| 45001.333333333336 | 32.49 |
| 45001.34375 | 32.49 |
| 45001.354166666664 | 32.48 |
| 45001.364583333336 | 32.47 |
| 45001.375 | 32.4 |
| 45001.385416666664 | 32.43 |
| 45001.395833333336 | 32.41 |
| 45001.40625 | 32.41 |
| 45001.416666666664 | 32.38 |
| 45001.427083333336 | 32.42 |
| 45001.4375 | 32.4 |
| 45001.447916666664 | 32.39 |
| 45001.458333333336 | 32.39 |
| 45001.46875 | 32.4 |
| 45001.479166666664 | 32.36 |
| 45001.489583333336 | 32.29 |
| 45001.5 | 32.21 |
| 45001.510416666664 | 32.15 |
| 45001.520833333336 | 32.09 |
| 45001.53125 | 31.97 |
| 45001.541666666664 | 31.88 |
| 45001.552083333336 | 31.74 |
| 45001.5625 | 31.58 |
| 45001.572916666664 | 31.4 |
| 45001.583333333336 | 31.3 |
| 45001.59375 | 31.25 |
| 45001.604166666664 | 31.22 |
| 45001.614583333336 | 31.25 |
| 45001.625 | 31.37 |
| 45001.635416666664 | 31.42 |
| 45001.645833333336 | 31.48 |
| 45001.65625 | 31.55 |
| 45001.666666666664 | 31.66 |
| 45001.677083333336 | 31.77 |
| 45001.6875 | 31.92 |
| 45001.697916666664 | 32.06 |
| 45001.708333333336 | 32.18 |
| 45001.71875 | 32.26 |
| 45001.729166666664 | 32.31 |
| 45001.739583333336 | 32.33 |
| 45001.75 | 32.33 |
| 45001.760416666664 | 32.35 |
| 45001.770833333336 | 32.38 |
| 45001.78125 | 32.4 |
| 45001.791666666664 | 32.41 |
| 45001.802083333336 | 32.44 |
| 45001.8125 | 32.47 |
| 45001.822916666664 | 32.43 |
| 45001.833333333336 | 32.41 |
| 45001.84375 | 32.4 |
| 45001.854166666664 | 32.39 |
| 45001.864583333336 | 32.39 |
| 45001.875 | 32.36 |
| 45001.885416666664 | 32.34 |
| 45001.895833333336 | 32.39 |
| 45001.90625 | 32.41 |
| 45001.916666666664 | 32.42 |
| 45001.927083333336 | 32.42 |
| 45001.9375 | 32.42 |
| 45001.947916666664 | 32.43 |
| 45001.958333333336 | 32.34 |
| 45001.96875 | 32.39 |
| 45001.979166666664 | 32.39 |
| 45001.989583333336 | 32.44 |
| 45002.0 | 32.32 |
| 45002.010416666664 | 32.34 |
| 45002.020833333336 | 32.33 |
| 45002.03125 | 32.29 |
| 45002.041666666664 | 31.94 |
| 45002.052083333336 | 31.8 |
| 45002.0625 | 31.69 |
| 45002.072916666664 | 31.64 |
| 45002.083333333336 | 31.56 |
| 45002.09375 | 31.51 |
| 45002.104166666664 | 31.44 |
| 45002.114583333336 | 31.43 |
| 45002.125 | 31.47 |
| 45002.135416666664 | 31.53 |
| 45002.145833333336 | 31.56 |
| 45002.15625 | 31.58 |
| 45002.166666666664 | 31.65 |
| 45002.177083333336 | 31.75 |
| 45002.1875 | 31.88 |
| 45002.197916666664 | 32 |
| 45002.208333333336 | 32.13 |
| 45002.21875 | 32.21 |
| 45002.229166666664 | 32.25 |
| 45002.239583333336 | 32.3 |
| 45002.25 | 32.37 |
| 45002.260416666664 | 32.41 |
| 45002.270833333336 | 32.43 |
| 45002.28125 | 32.45 |
| 45002.291666666664 | 32.46 |
| 45002.302083333336 | 32.48 |
| 45002.3125 | 32.48 |
| 45002.322916666664 | 32.48 |
| 45002.333333333336 | 32.48 |
| 45002.34375 | 32.47 |
| 45002.354166666664 | 32.47 |
| 45002.364583333336 | 32.46 |
| 45002.375 | 32.46 |
| 45002.385416666664 | 32.47 |
| 45002.395833333336 | 32.48 |
| 45002.40625 | 32.46 |
| 45002.416666666664 | 32.41 |
| 45002.427083333336 | 32.44 |
| 45002.4375 | 32.42 |
| 45002.447916666664 | 32.45 |
| 45002.458333333336 | 32.45 |
| 45002.46875 | 32.45 |
| 45002.479166666664 | 32.43 |
| 45002.489583333336 | 32.4 |
| 45002.5 | 32.38 |
| 45002.510416666664 | 32.39 |
| 45002.520833333336 | 32.36 |
| 45002.53125 | 32.36 |
| 45002.541666666664 | 32.33 |
| 45002.552083333336 | 32.28 |
| 45002.5625 | 32.21 |
| 45002.572916666664 | 32.19 |
| 45002.583333333336 | 32.07 |
| 45002.59375 | 31.9 |
| 45002.604166666664 | 31.79 |
| 45002.614583333336 | 31.69 |
| 45002.625 | 31.63 |
| 45002.635416666664 | 31.57 |
| 45002.645833333336 | 31.56 |
| 45002.65625 | 31.54 |
| 45002.666666666664 | 31.59 |
| 45002.677083333336 | 31.61 |
| 45002.6875 | 31.65 |
| 45002.697916666664 | 31.68 |
| 45002.708333333336 | 31.74 |
| 45002.71875 | 31.87 |
| 45002.729166666664 | 32.02 |
| 45002.739583333336 | 32.18 |
| 45002.75 | 32.25 |
| 45002.760416666664 | 32.27 |
| 45002.770833333336 | 32.33 |
| 45002.78125 | 32.41 |
| 45002.791666666664 | 32.48 |
| 45002.802083333336 | 32.52 |
| 45002.8125 | 32.55 |
| 45002.822916666664 | 32.55 |
| 45002.833333333336 | 32.55 |
| 45002.84375 | 32.55 |
| 45002.854166666664 | 32.56 |
| 45002.864583333336 | 32.56 |
| 45002.875 | 32.55 |
| 45002.885416666664 | 32.54 |
| 45002.895833333336 | 32.54 |
| 45002.90625 | 32.54 |
| 45002.916666666664 | 32.54 |
| 45002.927083333336 | 32.5 |
| 45002.9375 | 32.46 |
| 45002.947916666664 | 32.48 |
| 45002.958333333336 | 32.48 |
| 45002.96875 | 32.54 |
| 45002.979166666664 | 32.52 |
| 45002.989583333336 | 32.5 |
| 45003.0 | 32.5 |
| 45003.010416666664 | 32.47 |
| 45003.020833333336 | 32.49 |
| 45003.03125 | 32.49 |
| 45003.041666666664 | 32.46 |
| 45003.052083333336 | 32.43 |
| 45003.0625 | 32.4 |
| 45003.072916666664 | 32.23 |
| 45003.083333333336 | 31.96 |
| 45003.09375 | 31.75 |
| 45003.104166666664 | 31.58 |
| 45003.114583333336 | 31.46 |
| 45003.125 | 31.38 |
| 45003.135416666664 | 31.32 |
| 45003.145833333336 | 31.29 |
| 45003.15625 | 31.23 |
| 45003.166666666664 | 31.24 |
| 45003.177083333336 | 31.27 |
| 45003.1875 | 31.35 |
| 45003.197916666664 | 31.36 |
| 45003.208333333336 | 31.43 |
| 45003.21875 | 31.54 |
| 45003.229166666664 | 31.72 |
| 45003.239583333336 | 31.9 |
| 45003.25 | 32.1 |
| 45003.260416666664 | 32.2 |
| 45003.270833333336 | 32.26 |
| 45003.28125 | 32.31 |
| 45003.291666666664 | 32.35 |
| 45003.302083333336 | 32.39 |
| 45003.3125 | 32.44 |
| 45003.322916666664 | 32.47 |
| 45003.333333333336 | 32.48 |
| 45003.34375 | 32.47 |
| 45003.354166666664 | 32.49 |
| 45003.364583333336 | 32.49 |
| 45003.375 | 32.49 |
| 45003.385416666664 | 32.49 |
| 45003.395833333336 | 32.48 |
| 45003.40625 | 32.48 |
| 45003.416666666664 | 32.49 |
| 45003.427083333336 | 32.51 |
| 45003.4375 | 32.53 |
| 45003.447916666664 | 32.53 |
| 45003.458333333336 | 32.51 |
| 45003.46875 | 32.48 |
| 45003.479166666664 | 32.49 |
| 45003.489583333336 | 32.48 |
| 45003.5 | 32.46 |
| 45003.510416666664 | 32.44 |
| 45003.520833333336 | 32.4 |
| 45003.53125 | 32.39 |
| 45003.541666666664 | 32.34 |
| 45003.552083333336 | 32.31 |
| 45003.5625 | 32.23 |
| 45003.572916666664 | 32.16 |
| 45003.583333333336 | 32.14 |
| 45003.59375 | 32.13 |
| 45003.604166666664 | 32.11 |
| 45003.614583333336 | 32.04 |
| 45003.625 | 31.97 |
| 45003.635416666664 | 31.83 |
| 45003.645833333336 | 31.69 |
| 45003.65625 | 31.5 |
| 45003.666666666664 | 31.39 |
| 45003.677083333336 | 31.19 |
| 45003.6875 | 31.09 |
| 45003.697916666664 | 31.01 |
| 45003.708333333336 | 31.07 |
| 45003.71875 | 31.15 |
| 45003.729166666664 | 31.24 |
| 45003.739583333336 | 31.3 |
| 45003.75 | 31.39 |
| 45003.760416666664 | 31.53 |
| 45003.770833333336 | 31.77 |
| 45003.78125 | 31.93 |
| 45003.791666666664 | 32.01 |
| 45003.802083333336 | 32.06 |
| 45003.8125 | 32.1 |
| 45003.822916666664 | 32.13 |
| 45003.833333333336 | 32.16 |
| 45003.84375 | 32.2 |
| 45003.854166666664 | 32.25 |
| 45003.864583333336 | 32.31 |
| 45003.875 | 32.35 |
| 45003.885416666664 | 32.38 |
| 45003.895833333336 | 32.37 |
| 45003.90625 | 32.37 |
| 45003.916666666664 | 32.38 |
| 45003.927083333336 | 32.38 |
| 45003.9375 | 32.38 |
| 45003.947916666664 | 32.38 |
| 45003.958333333336 | 32.38 |
| 45003.96875 | 32.38 |
| 45003.979166666664 | 32.37 |
| 45003.989583333336 | 32.34 |
| 45004.0 | 32.35 |
| 45004.010416666664 | 32.34 |
| 45004.020833333336 | 32.34 |
| 45004.03125 | 32.34 |
| 45004.041666666664 | 32.34 |
| 45004.052083333336 | 32.34 |
| 45004.0625 | 32.31 |
| 45004.072916666664 | 32.29 |
| 45004.083333333336 | 32.26 |
| 45004.09375 | 32.17 |
| 45004.104166666664 | 32.13 |
| 45004.114583333336 | 32.03 |
| 45004.125 | 31.94 |
| 45004.135416666664 | 31.83 |
| 45004.145833333336 | 31.58 |
| 45004.15625 | 31.47 |
| 45004.166666666664 | 31.35 |
| 45004.177083333336 | 31.28 |
| 45004.1875 | 31.25 |
| 45004.197916666664 | 31.19 |
| 45004.208333333336 | 31.13 |
| 45004.21875 | 31.09 |
| 45004.229166666664 | 31.17 |
| 45004.239583333336 | 31.25 |
| 45004.25 | 31.2 |
| 45004.260416666664 | 31.27 |
| 45004.270833333336 | 31.35 |
| 45004.28125 | 31.49 |
| 45004.291666666664 | 31.72 |
| 45004.302083333336 | 31.85 |
| 45004.3125 | 31.9 |
| 45004.322916666664 | 31.98 |
| 45004.333333333336 | 32.05 |
| 45004.34375 | 32.11 |
| 45004.354166666664 | 32.16 |
| 45004.364583333336 | 32.2 |
| 45004.375 | 32.26 |
| 45004.385416666664 | 32.3 |
| 45004.395833333336 | 32.33 |
| 45004.40625 | 32.35 |
| 45004.416666666664 | 32.35 |
| 45004.427083333336 | 32.36 |
| 45004.4375 | 32.36 |
| 45004.447916666664 | 32.38 |
| 45004.458333333336 | 32.4 |
| 45004.46875 | 32.42 |
| 45004.479166666664 | 32.42 |
| 45004.489583333336 | 32.39 |
| 45004.5 | 32.34 |
| 45004.510416666664 | 32.38 |
| 45004.520833333336 | 32.41 |
| 45004.53125 | 32.39 |
| 45004.541666666664 | 32.34 |
| 45004.552083333336 | 32.35 |
| 45004.5625 | 32.3 |
| 45004.572916666664 | 32.3 |
| 45004.583333333336 | 32.27 |
| 45004.59375 | 32.24 |
| 45004.604166666664 | 32.25 |
| 45004.614583333336 | 32.18 |
| 45004.625 | 32.19 |
| 45004.635416666664 | 32.12 |
| 45004.645833333336 | 32.14 |
| 45004.65625 | 32.11 |
| 45004.666666666664 | 31.98 |
| 45004.677083333336 | 31.89 |
| 45004.6875 | 32.06 |
| 45004.697916666664 | 31.5 |
| 45004.708333333336 | 31.37 |
| 45004.71875 | 31.14 |
| 45004.729166666664 | 31.09 |
| 45004.739583333336 | 30.93 |
| 45004.75 | 31.07 |
| 45004.760416666664 | 31.17 |
| 45004.770833333336 | 31.14 |
| 45004.78125 | 31.19 |
| 45004.791666666664 | 31.26 |
| 45004.802083333336 | 31.47 |
| 45004.8125 | 31.75 |
| 45004.822916666664 | 31.83 |
| 45004.833333333336 | 31.89 |
| 45004.84375 | 31.95 |
| 45004.854166666664 | 32 |
| 45004.864583333336 | 32.08 |
| 45004.875 | 32.14 |
| 45004.885416666664 | 32.17 |
| 45004.895833333336 | 32.25 |
| 45004.90625 | 32.31 |
| 45004.916666666664 | 32.35 |
| 45004.927083333336 | 32.35 |
| 45004.9375 | 32.36 |
| 45004.947916666664 | 32.35 |
| 45004.958333333336 | 32.36 |
| 45004.96875 | 32.36 |
| 45004.979166666664 | 32.36 |
| 45004.989583333336 | 32.37 |
| 45005.0 | 32.37 |
| 45005.010416666664 | 32.39 |
| 45005.020833333336 | 32.34 |
| 45005.03125 | 32.35 |
| 45005.041666666664 | 32.35 |
| 45005.052083333336 | 32.35 |
| 45005.0625 | 32.35 |
| 45005.072916666664 | 32.32 |
| 45005.083333333336 | 32.33 |
| 45005.09375 | 32.29 |
| 45005.104166666664 | 32.25 |
| 45005.114583333336 | 32.28 |
| 45005.125 | 32.27 |
| 45005.135416666664 | 32.15 |
| 45005.145833333336 | 32.1 |
| 45005.15625 | 31.91 |
| 45005.166666666664 | 31.83 |
| 45005.177083333336 | 31.61 |
| 45005.1875 | 31.32 |
| 45005.197916666664 | 31.17 |
| 45005.208333333336 | 31 |
| 45005.21875 | 31.01 |
| 45005.229166666664 | 30.89 |
| 45005.239583333336 | 30.87 |
| 45005.25 | 30.87 |
| 45005.260416666664 | 30.89 |
| 45005.270833333336 | 30.94 |
| 45005.28125 | 30.89 |
| 45005.291666666664 | 30.87 |
| 45005.302083333336 | 30.92 |
| 45005.3125 | 31.1 |
| 45005.322916666664 | 31.36 |
| 45005.333333333336 | 31.58 |
| 45005.34375 | 31.84 |
| 45005.354166666664 | 31.94 |
| 45005.364583333336 | 31.99 |
| 45005.375 | 32.07 |
| 45005.385416666664 | 32.17 |
| 45005.395833333336 | 32.22 |
| 45005.40625 | 32.28 |
| 45005.416666666664 | 32.33 |
| 45005.427083333336 | 32.35 |
| 45005.4375 | 32.35 |
| 45005.447916666664 | 32.35 |
| 45005.458333333336 | 32.37 |
| 45005.46875 | 32.38 |
| 45005.479166666664 | 32.4 |
| 45005.489583333336 | 32.42 |
| 45005.5 | 32.43 |
| 45005.510416666664 | 32.45 |
| 45005.520833333336 | 32.47 |
| 45005.53125 | 32.35 |
| 45005.541666666664 | 32.41 |
| 45005.552083333336 | 32.43 |
| 45005.5625 | 32.4 |
| 45005.572916666664 | 32.39 |
| 45005.583333333336 | 32.37 |
| 45005.59375 | 32.33 |
| 45005.604166666664 | 32.32 |
| 45005.614583333336 | 32.32 |
| 45005.625 | 32.3 |
| 45005.635416666664 | 32.26 |
| 45005.645833333336 | 32.24 |
| 45005.65625 | 32.23 |
| 45005.666666666664 | 32.23 |
| 45005.677083333336 | 32.16 |
| 45005.6875 | 32.06 |
| 45005.697916666664 | 31.89 |
| 45005.708333333336 | 31.61 |
| 45005.71875 | 31.53 |
| 45005.729166666664 | 31.34 |
| 45005.739583333336 | 31.32 |
| 45005.75 | 31.21 |
| 45005.760416666664 | 31.11 |
| 45005.770833333336 | 31.11 |
| 45005.78125 | 31.07 |
| 45005.791666666664 | 31.19 |
| 45005.802083333336 | 31.09 |
| 45005.8125 | 31.06 |
| 45005.822916666664 | 31.19 |
| 45005.833333333336 | 31.38 |
| 45005.84375 | 31.53 |
| 45005.854166666664 | 31.69 |
| 45005.864583333336 | 31.87 |
| 45005.875 | 32 |
| 45005.885416666664 | 32.04 |
| 45005.895833333336 | 32.15 |
| 45005.90625 | 32.15 |
| 45005.916666666664 | 32.19 |
| 45005.927083333336 | 32.25 |
| 45005.9375 | 32.32 |
| 45005.947916666664 | 32.36 |
| 45005.958333333336 | 32.37 |
| 45005.96875 | 32.38 |
| 45005.979166666664 | 32.39 |
| 45005.989583333336 | 32.41 |
| 45006.0 | 32.42 |
| 45006.010416666664 | 32.44 |
| 45006.020833333336 | 32.47 |
| 45006.03125 | 32.49 |
| 45006.041666666664 | 32.47 |
| 45006.052083333336 | 32.43 |
| 45006.0625 | 32.45 |
| 45006.072916666664 | 32.42 |
| 45006.083333333336 | 32.4 |
| 45006.09375 | 32.39 |
| 45006.104166666664 | 32.41 |
| 45006.114583333336 | 32.36 |
| 45006.125 | 32.36 |
| 45006.135416666664 | 32.32 |
| 45006.145833333336 | 32.33 |
| 45006.15625 | 32.32 |
| 45006.166666666664 | 32.24 |
| 45006.177083333336 | 32.2 |
| 45006.1875 | 32.04 |
| 45006.197916666664 | 31.86 |
| 45006.208333333336 | 31.73 |
| 45006.21875 | 31.77 |
| 45006.229166666664 | 31.38 |
| 45006.239583333336 | 31.42 |
| 45006.25 | 31.35 |
| 45006.260416666664 | 31.18 |
| 45006.270833333336 | 31.17 |
| 45006.28125 | 31.27 |
| 45006.291666666664 | 31.23 |
| 45006.302083333336 | 31.22 |
| 45006.3125 | 31.26 |
| 45006.322916666664 | 31.24 |
| 45006.333333333336 | 31.23 |
| 45006.34375 | 31.22 |
| 45006.354166666664 | 31.32 |
| 45006.364583333336 | 31.5 |
| 45006.375 | 31.61 |
| 45006.385416666664 | 31.83 |
| 45006.395833333336 | 31.94 |
| 45006.40625 | 32 |
| 45006.416666666664 | 32.1 |
| 45006.427083333336 | 32.18 |
| 45006.4375 | 32.26 |
| 45006.447916666664 | 32.32 |
| 45006.458333333336 | 32.38 |
| 45006.46875 | 32.39 |
| 45006.479166666664 | 32.4 |
| 45006.489583333336 | 32.39 |
| 45006.5 | 32.4 |
| 45006.510416666664 | 32.41 |
| 45006.520833333336 | 32.43 |
| 45006.53125 | 32.44 |
| 45006.541666666664 | 32.46 |
| 45006.552083333336 | 32.47 |
| 45006.5625 | 32.47 |
| 45006.572916666664 | 32.37 |
| 45006.583333333336 | 32.41 |
| 45006.59375 | 32.41 |
| 45006.604166666664 | 32.4 |
| 45006.614583333336 | 32.38 |
| 45006.625 | 32.38 |
| 45006.635416666664 | 32.37 |
| 45006.645833333336 | 32.34 |
| 45006.65625 | 32.34 |
| 45006.666666666664 | 32.31 |
| 45006.677083333336 | 32.28 |
| 45006.6875 | 32.25 |
| 45006.697916666664 | 32.18 |
| 45006.708333333336 | 31.99 |
| 45006.71875 | 31.73 |
| 45006.729166666664 | 31.58 |
| 45006.739583333336 | 31.59 |
| 45006.75 | 31.41 |
| 45006.760416666664 | 31.25 |
| 45006.770833333336 | 31.13 |
| 45006.78125 | 31.08 |
| 45006.791666666664 | 31.12 |
| 45006.802083333336 | 31.13 |
| 45006.8125 | 31.15 |
| 45006.822916666664 | 31.15 |
| 45006.833333333336 | 31.15 |
| 45006.84375 | 31.11 |
| 45006.854166666664 | 31.13 |
| 45006.864583333336 | 31.27 |
| 45006.875 | 31.47 |
| 45006.885416666664 | 31.61 |
| 45006.895833333336 | 31.79 |
| 45006.90625 | 31.93 |
| 45006.916666666664 | 32.1 |
| 45006.927083333336 | 32.19 |
| 45006.9375 | 32.27 |
| 45006.947916666664 | 32.33 |
| 45006.958333333336 | 32.38 |
| 45006.96875 | 32.44 |
| 45006.979166666664 | 32.42 |
| 45006.989583333336 | 32.43 |
| 45007.0 | 32.47 |
| 45007.010416666664 | 32.44 |
| 45007.020833333336 | 32.47 |
| 45007.03125 | 32.5 |
| 45007.041666666664 | 32.53 |
| 45007.052083333336 | 32.54 |
| 45007.0625 | 32.54 |
| 45007.072916666664 | 32.54 |
| 45007.083333333336 | 32.48 |
| 45007.09375 | 32.43 |
| 45007.104166666664 | 32.42 |
| 45007.114583333336 | 32.48 |
| 45007.125 | 32.49 |
| 45007.135416666664 | 32.43 |
| 45007.145833333336 | 32.45 |
| 45007.15625 | 32.4 |
| 45007.166666666664 | 32.39 |
| 45007.177083333336 | 32.41 |
| 45007.1875 | 32.38 |
| 45007.197916666664 | 32.36 |
| 45007.208333333336 | 32.3 |
| 45007.21875 | 32.22 |
| 45007.229166666664 | 32.1 |
| 45007.239583333336 | 31.95 |
| 45007.25 | 31.82 |
| 45007.260416666664 | 31.69 |
| 45007.270833333336 | 31.57 |
| 45007.28125 | 31.46 |
| 45007.291666666664 | 31.37 |
| 45007.302083333336 | 31.31 |
| 45007.3125 | 31.33 |
| 45007.322916666664 | 31.35 |
| 45007.333333333336 | 31.38 |
| 45007.34375 | 31.33 |
| 45007.354166666664 | 31.37 |
| 45007.364583333336 | 31.34 |
| 45007.375 | 31.33 |
| 45007.385416666664 | 31.41 |
| 45007.395833333336 | 31.6 |
| 45007.40625 | 31.72 |
| 45007.416666666664 | 31.9 |
| 45007.427083333336 | 32.05 |
| 45007.4375 | 32.14 |
| 45007.447916666664 | 32.21 |
| 45007.458333333336 | 32.28 |
| 45007.46875 | 32.33 |
| 45007.479166666664 | 32.39 |
| 45007.489583333336 | 32.44 |
| 45007.5 | 32.46 |
| 45007.510416666664 | 32.47 |
| 45007.520833333336 | 32.46 |
| 45007.53125 | 32.45 |
| 45007.541666666664 | 32.44 |
| 45007.552083333336 | 32.45 |
| 45007.5625 | 32.47 |
| 45007.572916666664 | 32.49 |
| 45007.583333333336 | 32.51 |
| 45007.59375 | 32.51 |
| 45007.604166666664 | 32.42 |
| 45007.614583333336 | 32.47 |
| 45007.625 | 32.43 |
| 45007.635416666664 | 32.48 |
| 45007.645833333336 | 32.43 |
| 45007.65625 | 32.46 |
| 45007.666666666664 | 32.44 |
| 45007.677083333336 | 32.4 |
| 45007.6875 | 32.4 |
| 45007.697916666664 | 32.34 |
| 45007.708333333336 | 32.35 |
| 45007.71875 | 32.31 |
| 45007.729166666664 | 32.26 |
| 45007.739583333336 | 32.17 |
| 45007.75 | 32.07 |
| 45007.760416666664 | 32.02 |
| 45007.770833333336 | 31.94 |
| 45007.78125 | 31.73 |
| 45007.791666666664 | 31.72 |
| 45007.802083333336 | 31.63 |
| 45007.8125 | 31.49 |
| 45007.822916666664 | 31.47 |
| 45007.833333333336 | 31.46 |
| 45007.84375 | 31.46 |
| 45007.854166666664 | 31.58 |
| 45007.864583333336 | 31.45 |
| 45007.875 | 31.43 |
| 45007.885416666664 | 31.49 |
| 45007.895833333336 | 31.68 |
| 45007.90625 | 31.82 |
| 45007.916666666664 | 31.93 |
| 45007.927083333336 | 32.02 |
| 45007.9375 | 32.13 |
| 45007.947916666664 | 32.22 |
| 45007.958333333336 | 32.28 |
| 45007.96875 | 32.34 |
| 45007.979166666664 | 32.4 |
| 45007.989583333336 | 32.44 |
| 45008.0 | 32.45 |
| 45008.010416666664 | 32.45 |
| 45008.020833333336 | 32.44 |
| 45008.03125 | 32.43 |
| 45008.041666666664 | 32.45 |
| 45008.052083333336 | 32.5 |
| 45008.0625 | 32.53 |
| 45008.072916666664 | 32.55 |
| 45008.083333333336 | 32.56 |
| 45008.09375 | 32.57 |
| 45008.104166666664 | 32.56 |
| 45008.114583333336 | 32.55 |
| 45008.125 | 32.51 |
| 45008.135416666664 | 32.51 |
| 45008.145833333336 | 32.49 |
| 45008.15625 | 32.48 |
| 45008.166666666664 | 32.46 |
| 45008.177083333336 | 32.44 |
| 45008.1875 | 32.44 |
| 45008.197916666664 | 32.44 |
| 45008.208333333336 | 32.46 |
| 45008.21875 | 32.43 |
| 45008.229166666664 | 32.37 |
| 45008.239583333336 | 32.41 |
| 45008.25 | 32.39 |
| 45008.260416666664 | 32.37 |
| 45008.270833333336 | 32.28 |
| 45008.28125 | 32.18 |
| 45008.291666666664 | 32.03 |
| 45008.302083333336 | 32.01 |
| 45008.3125 | 31.77 |
| 45008.322916666664 | 31.55 |
| 45008.333333333336 | 31.51 |
| 45008.34375 | 31.36 |
| 45008.354166666664 | 31.31 |
| 45008.364583333336 | 31.31 |
| 45008.375 | 31.34 |
| 45008.385416666664 | 31.36 |
| 45008.395833333336 | 31.39 |
| 45008.40625 | 31.48 |
| 45008.416666666664 | 31.67 |
| 45008.427083333336 | 31.84 |
| 45008.4375 | 31.94 |
| 45008.447916666664 | 32.04 |
| 45008.458333333336 | 32.14 |
| 45008.46875 | 32.25 |
| 45008.479166666664 | 32.32 |
| 45008.489583333336 | 32.38 |
| 45008.5 | 32.41 |
| 45008.510416666664 | 32.45 |
| 45008.520833333336 | 32.47 |
| 45008.53125 | 32.47 |
| 45008.541666666664 | 32.46 |
| 45008.552083333336 | 32.46 |
| 45008.5625 | 32.5 |
| 45008.572916666664 | 32.57 |
| 45008.583333333336 | 32.63 |
| 45008.59375 | 32.66 |
| 45008.604166666664 | 32.67 |
| 45008.614583333336 | 32.67 |
| 45008.625 | 32.66 |
| 45008.635416666664 | 32.63 |
| 45008.645833333336 | 32.55 |
| 45008.65625 | 32.53 |
| 45008.666666666664 | 32.58 |
| 45008.677083333336 | 32.55 |
| 45008.6875 | 32.53 |
| 45008.697916666664 | 32.48 |
| 45008.708333333336 | 32.46 |
| 45008.71875 | 32.39 |
| 45008.729166666664 | 32.5 |
| 45008.739583333336 | 32.45 |
| 45008.75 | 32.4 |
| 45008.760416666664 | 32.38 |
| 45008.770833333336 | 32.29 |
| 45008.78125 | 32.25 |
| 45008.791666666664 | 32.14 |
| 45008.802083333336 | 32.09 |
| 45008.8125 | 32.05 |
| 45008.822916666664 | 31.9 |
| 45008.833333333336 | 31.75 |
| 45008.84375 | 31.69 |
| 45008.854166666664 | 31.58 |
| 45008.864583333336 | 31.49 |
| 45008.875 | 31.52 |
| 45008.885416666664 | 31.7 |
| 45008.895833333336 | 31.67 |
| 45008.90625 | 31.71 |
| 45008.916666666664 | 31.81 |
| 45008.927083333336 | 31.98 |
| 45008.9375 | 32.12 |
| 45008.947916666664 | 32.2 |
| 45008.958333333336 | 32.3 |
| 45008.96875 | 32.48 |
| 45008.979166666664 | 32.58 |
| 45008.989583333336 | 32.61 |
| 45009.0 | 32.69 |
| 45009.010416666664 | 32.68 |
| 45009.020833333336 | 32.66 |
| 45009.03125 | 32.64 |
| 45009.041666666664 | 32.58 |
| 45009.052083333336 | 32.54 |
| 45009.0625 | 32.52 |
| 45009.072916666664 | 32.51 |
| 45009.083333333336 | 32.54 |
| 45009.09375 | 32.58 |
| 45009.104166666664 | 32.63 |
| 45009.114583333336 | 32.62 |
| 45009.125 | 32.62 |
| 45009.135416666664 | 32.61 |
| 45009.145833333336 | 32.61 |
| 45009.15625 | 32.65 |
| 45009.166666666664 | 32.57 |
| 45009.177083333336 | 32.56 |
| 45009.1875 | 32.57 |
| 45009.197916666664 | 32.57 |
| 45009.208333333336 | 32.57 |
| 45009.21875 | 32.57 |
| 45009.229166666664 | 32.59 |
| 45009.239583333336 | 32.61 |
| 45009.25 | 32.61 |
| 45009.260416666664 | 32.61 |
| 45009.270833333336 | 32.58 |
| 45009.28125 | 32.55 |
| 45009.291666666664 | 32.51 |
| 45009.302083333336 | 32.36 |
| 45009.3125 | 32.24 |
| 45009.322916666664 | 32.11 |
| 45009.333333333336 | 32.01 |
| 45009.34375 | 31.85 |
| 45009.354166666664 | 31.69 |
| 45009.364583333336 | 31.57 |
| 45009.375 | 31.48 |
| 45009.385416666664 | 31.37 |
| 45009.395833333336 | 31.34 |
| 45009.40625 | 31.39 |
| 45009.416666666664 | 31.44 |
| 45009.427083333336 | 31.44 |
| 45009.4375 | 31.58 |
| 45009.447916666664 | 31.71 |
| 45009.458333333336 | 31.95 |
| 45009.46875 | 32.04 |
| 45009.479166666664 | 32.12 |
| 45009.489583333336 | 32.22 |
| 45009.5 | 32.3 |
| 45009.510416666664 | 32.36 |
| 45009.520833333336 | 32.41 |
| 45009.53125 | 32.46 |
| 45009.541666666664 | 32.48 |
| 45009.552083333336 | 32.51 |
| 45009.5625 | 32.54 |
| 45009.572916666664 | 32.53 |
| 45009.583333333336 | 32.53 |
| 45009.59375 | 32.52 |
| 45009.604166666664 | 32.53 |
| 45009.614583333336 | 32.54 |
| 45009.625 | 32.57 |
| 45009.635416666664 | 32.58 |
| 45009.645833333336 | 32.52 |
| 45009.65625 | 32.53 |
| 45009.666666666664 | 32.53 |
| 45009.677083333336 | 32.54 |
| 45009.6875 | 32.54 |
| 45009.697916666664 | 32.52 |
| 45009.708333333336 | 32.54 |
| 45009.71875 | 32.54 |
| 45009.729166666664 | 32.53 |
| 45009.739583333336 | 32.47 |
| 45009.75 | 32.49 |
| 45009.760416666664 | 32.44 |
| 45009.770833333336 | 32.42 |
| 45009.78125 | 32.43 |
| 45009.791666666664 | 32.35 |
| 45009.802083333336 | 32.34 |
| 45009.8125 | 32.36 |
| 45009.822916666664 | 32.32 |
| 45009.833333333336 | 32.22 |
| 45009.84375 | 32.16 |
| 45009.854166666664 | 32 |
| 45009.864583333336 | 31.87 |
| 45009.875 | 31.67 |
| 45009.885416666664 | 31.57 |
| 45009.895833333336 | 31.58 |
| 45009.90625 | 31.6 |
| 45009.916666666664 | 31.66 |
| 45009.927083333336 | 31.61 |
| 45009.9375 | 31.6 |
| 45009.947916666664 | 31.6 |
| 45009.958333333336 | 31.69 |
| 45009.96875 | 31.81 |
| 45009.979166666664 | 31.97 |
| 45009.989583333336 | 32.04 |
| 45010.0 | 32.18 |
| 45010.010416666664 | 32.26 |
| 45010.020833333336 | 32.31 |
| 45010.03125 | 32.4 |
| 45010.041666666664 | 32.45 |
| 45010.052083333336 | 32.48 |
| 45010.0625 | 32.48 |
| 45010.072916666664 | 32.49 |
| 45010.083333333336 | 32.48 |
| 45010.09375 | 32.48 |
| 45010.104166666664 | 32.47 |
| 45010.114583333336 | 32.44 |
| 45010.125 | 32.42 |
| 45010.135416666664 | 32.43 |
| 45010.145833333336 | 32.43 |
| 45010.15625 | 32.39 |
| 45010.166666666664 | 32.44 |
| 45010.177083333336 | 32.42 |
| 45010.1875 | 32.37 |
| 45010.197916666664 | 32.4 |
| 45010.208333333336 | 32.42 |
| 45010.21875 | 32.43 |
| 45010.229166666664 | 32.43 |
| 45010.239583333336 | 32.39 |
| 45010.25 | 32.42 |
| 45010.260416666664 | 32.41 |
| 45010.270833333336 | 32.41 |
| 45010.28125 | 32.41 |
| 45010.291666666664 | 32.42 |
| 45010.302083333336 | 32.42 |
| 45010.3125 | 32.41 |
| 45010.322916666664 | 32.37 |
| 45010.333333333336 | 32.42 |
| 45010.34375 | 32.37 |
| 45010.354166666664 | 32.32 |
| 45010.364583333336 | 32.25 |
| 45010.375 | 32.11 |
| 45010.385416666664 | 32.05 |
| 45010.395833333336 | 31.97 |
| 45010.40625 | 31.82 |
| 45010.416666666664 | 31.76 |
| 45010.427083333336 | 31.7 |
| 45010.4375 | 31.66 |
| 45010.447916666664 | 31.65 |
| 45010.458333333336 | 31.75 |
| 45010.46875 | 31.73 |
| 45010.479166666664 | 31.75 |
| 45010.489583333336 | 31.83 |
| 45010.5 | 31.91 |
| 45010.510416666664 | 31.98 |
| 45010.520833333336 | 32.05 |
| 45010.53125 | 32.14 |
| 45010.541666666664 | 32.2 |
| 45010.552083333336 | 32.26 |
| 45010.5625 | 32.33 |
| 45010.572916666664 | 32.36 |
| 45010.583333333336 | 32.4 |
| 45010.59375 | 32.42 |
| 45010.604166666664 | 32.43 |
| 45010.614583333336 | 32.45 |
| 45010.625 | 32.44 |
| 45010.635416666664 | 32.45 |
| 45010.645833333336 | 32.44 |
| 45010.65625 | 32.45 |
| 45010.666666666664 | 32.44 |
| 45010.677083333336 | 32.45 |
| 45010.6875 | 32.45 |
| 45010.697916666664 | 32.37 |
| 45010.708333333336 | 32.37 |
| 45010.71875 | 32.39 |
| 45010.729166666664 | 32.4 |
| 45010.739583333336 | 32.36 |
| 45010.75 | 32.4 |
| 45010.760416666664 | 32.36 |
| 45010.770833333336 | 32.38 |
| 45010.78125 | 32.37 |
| 45010.791666666664 | 32.38 |
| 45010.802083333336 | 32.35 |
| 45010.8125 | 32.32 |
| 45010.822916666664 | 32.28 |
| 45010.833333333336 | 32.28 |
| 45010.84375 | 32.23 |
| 45010.854166666664 | 32.21 |
| 45010.864583333336 | 32.18 |
| 45010.875 | 32.12 |
| 45010.885416666664 | 32.12 |
| 45010.895833333336 | 32.06 |
| 45010.90625 | 32.05 |
| 45010.916666666664 | 32.02 |
| 45010.927083333336 | 31.96 |
| 45010.9375 | 32.02 |
| 45010.947916666664 | 32.03 |
| 45010.958333333336 | 31.99 |
| 45010.96875 | 32.03 |
| 45010.979166666664 | 32.08 |
| 45010.989583333336 | 32.16 |
| 45011.0 | 32.23 |
| 45011.010416666664 | 32.29 |
| 45011.020833333336 | 32.31 |
| 45011.03125 | 32.32 |
| 45011.041666666664 | 32.33 |
| 45011.052083333336 | 32.36 |
| 45011.0625 | 32.38 |
| 45011.072916666664 | 32.4 |
| 45011.083333333336 | 32.41 |
| 45011.09375 | 32.42 |
| 45011.104166666664 | 32.43 |
| 45011.114583333336 | 32.46 |
| 45011.125 | 32.48 |
| 45011.135416666664 | 32.49 |
| 45011.145833333336 | 32.5 |
| 45011.15625 | 32.51 |
| 45011.166666666664 | 32.53 |
| 45011.177083333336 | 32.55 |
| 45011.1875 | 32.58 |
| 45011.197916666664 | 32.58 |
| 45011.208333333336 | 32.58 |
| 45011.21875 | 32.53 |
| 45011.229166666664 | 32.53 |
| 45011.239583333336 | 32.54 |
| 45011.25 | 32.53 |
| 45011.260416666664 | 32.51 |
| 45011.270833333336 | 32.5 |
| 45011.28125 | 32.47 |
| 45011.291666666664 | 32.45 |
| 45011.302083333336 | 32.46 |
| 45011.3125 | 32.41 |
| 45011.322916666664 | 32.38 |
| 45011.333333333336 | 32.35 |
| 45011.34375 | 32.35 |
| 45011.354166666664 | 32.37 |
| 45011.364583333336 | 32.34 |
| 45011.375 | 32.31 |
| 45011.385416666664 | 32.29 |
| 45011.395833333336 | 32.21 |
| 45011.40625 | 32.19 |
| 45011.416666666664 | 32.04 |
| 45011.427083333336 | 31.95 |
| 45011.4375 | 31.85 |
| 45011.447916666664 | 31.81 |
| 45011.458333333336 | 31.75 |
| 45011.46875 | 31.73 |
| 45011.479166666664 | 31.74 |
| 45011.489583333336 | 31.82 |
| 45011.5 | 31.85 |
| 45011.510416666664 | 31.87 |
| 45011.520833333336 | 31.9 |
| 45011.53125 | 32.01 |
| 45011.541666666664 | 32.09 |
| 45011.552083333336 | 32.2 |
| 45011.5625 | 32.29 |
| 45011.572916666664 | 32.35 |
| 45011.583333333336 | 32.37 |
| 45011.59375 | 32.38 |
| 45011.604166666664 | 32.39 |
| 45011.614583333336 | 32.41 |
| 45011.625 | 32.43 |
| 45011.635416666664 | 32.45 |
| 45011.645833333336 | 32.46 |
| 45011.65625 | 32.47 |
| 45011.666666666664 | 32.48 |
| 45011.677083333336 | 32.49 |
| 45011.6875 | 32.5 |
| 45011.697916666664 | 32.5 |
| 45011.708333333336 | 32.5 |
| 45011.71875 | 32.48 |
| 45011.729166666664 | 32.49 |
| 45011.739583333336 | 32.48 |
| 45011.75 | 32.48 |
| 45011.760416666664 | 32.49 |
| 45011.770833333336 | 32.5 |
| 45011.78125 | 32.47 |
| 45011.791666666664 | 32.48 |
| 45011.802083333336 | 32.45 |
| 45011.8125 | 32.47 |
| 45011.822916666664 | 32.42 |
| 45011.833333333336 | 32.44 |
| 45011.84375 | 32.42 |
| 45011.854166666664 | 32.4 |
| 45011.864583333336 | 32.32 |
| 45011.875 | 32.22 |
| 45011.885416666664 | 32.22 |
| 45011.895833333336 | 32.1 |
| 45011.90625 | 32.15 |
| 45011.916666666664 | 32.01 |
| 45011.927083333336 | 32.04 |
| 45011.9375 | 31.9 |
| 45011.947916666664 | 31.81 |
| 45011.958333333336 | 31.79 |
| 45011.96875 | 31.78 |
| 45011.979166666664 | 31.86 |
| 45011.989583333336 | 31.92 |
| 45012.0 | 31.92 |
| 45012.010416666664 | 31.92 |
| 45012.020833333336 | 32 |
| 45012.03125 | 32.13 |
| 45012.041666666664 | 32.19 |
| 45012.052083333336 | 32.28 |
| 45012.0625 | 32.35 |
| 45012.072916666664 | 32.36 |
| 45012.083333333336 | 32.39 |
| 45012.09375 | 32.41 |
| 45012.104166666664 | 32.43 |
| 45012.114583333336 | 32.45 |
| 45012.125 | 32.47 |
| 45012.135416666664 | 32.48 |
| 45012.145833333336 | 32.5 |
| 45012.15625 | 32.5 |
| 45012.166666666664 | 32.5 |
| 45012.177083333336 | 32.52 |
| 45012.1875 | 32.53 |
| 45012.197916666664 | 32.54 |
| 45012.208333333336 | 32.54 |
| 45012.21875 | 32.54 |
| 45012.229166666664 | 32.55 |
| 45012.239583333336 | 32.54 |
| 45012.25 | 32.5 |
| 45012.260416666664 | 32.5 |
| 45012.270833333336 | 32.49 |
| 45012.28125 | 32.46 |
| 45012.291666666664 | 32.47 |
| 45012.302083333336 | 32.45 |
| 45012.3125 | 32.45 |
| 45012.322916666664 | 32.44 |
| 45012.333333333336 | 32.42 |
| 45012.34375 | 32.41 |
| 45012.354166666664 | 32.39 |
| 45012.364583333336 | 32.35 |
| 45012.375 | 32.37 |
| 45012.385416666664 | 32.23 |
| 45012.395833333336 | 32.18 |
| 45012.40625 | 32.11 |
| 45012.416666666664 | 32.01 |
| 45012.427083333336 | 31.89 |
| 45012.4375 | 31.82 |
| 45012.447916666664 | 31.72 |
| 45012.458333333336 | 31.64 |
| 45012.46875 | 31.58 |
| 45012.479166666664 | 31.54 |
| 45012.489583333336 | 31.51 |
| 45012.5 | 31.48 |
| 45012.510416666664 | 31.49 |
| 45012.520833333336 | 31.54 |
| 45012.53125 | 31.58 |
| 45012.541666666664 | 31.58 |
| 45012.552083333336 | 31.61 |
| 45012.5625 | 31.68 |
| 45012.572916666664 | 31.73 |
| 45012.583333333336 | 31.87 |
| 45012.59375 | 32.03 |
| 45012.604166666664 | 32.11 |
| 45012.614583333336 | 32.18 |
| 45012.625 | 32.24 |
| 45012.635416666664 | 32.28 |
| 45012.645833333336 | 32.32 |
| 45012.65625 | 32.35 |
| 45012.666666666664 | 32.38 |
| 45012.677083333336 | 32.41 |
| 45012.6875 | 32.42 |
| 45012.697916666664 | 32.46 |
| 45012.708333333336 | 32.45 |
| 45012.71875 | 32.46 |
| 45012.729166666664 | 32.46 |
| 45012.739583333336 | 32.35 |
| 45012.75 | 32.38 |
| 45012.760416666664 | 32.37 |
| 45012.770833333336 | 32.36 |
| 45012.78125 | 32.37 |
| 45012.791666666664 | 32.28 |
| 45012.802083333336 | 32.3 |
| 45012.8125 | 32.21 |
| 45012.822916666664 | 32.22 |
| 45012.833333333336 | 32.21 |
| 45012.84375 | 32.33 |
| 45012.854166666664 | 32.32 |
| 45012.864583333336 | 32.31 |
| 45012.875 | 32.29 |
| 45012.885416666664 | 32.24 |
| 45012.895833333336 | 32.13 |
| 45012.90625 | 32.04 |
| 45012.916666666664 | 32 |
| 45012.927083333336 | 31.99 |
| 45012.9375 | 31.94 |
| 45012.947916666664 | 31.9 |
| 45012.958333333336 | 31.89 |
| 45012.96875 | 31.83 |
| 45012.979166666664 | 31.8 |
| 45012.989583333336 | 31.8 |
| 45013.0 | 31.79 |
| 45013.010416666664 | 31.83 |
| 45013.020833333336 | 31.87 |
| 45013.03125 | 31.89 |
| 45013.041666666664 | 31.92 |
| 45013.052083333336 | 31.98 |
| 45013.0625 | 32.07 |
| 45013.072916666664 | 32.19 |
| 45013.083333333336 | 32.31 |
| 45013.09375 | 32.36 |
| 45013.104166666664 | 32.41 |
| 45013.114583333336 | 32.44 |
| 45013.125 | 32.48 |
| 45013.135416666664 | 32.5 |
| 45013.145833333336 | 32.52 |
| 45013.15625 | 32.53 |
| 45013.166666666664 | 32.55 |
| 45013.177083333336 | 32.4 |
| 45013.1875 | 32.43 |
| 45013.197916666664 | 32.46 |
| 45013.208333333336 | 32.48 |
| 45013.21875 | 32.5 |
| 45013.229166666664 | 32.52 |
| 45013.239583333336 | 32.53 |
| 45013.25 | 32.53 |
| 45013.260416666664 | 32.53 |
| 45013.270833333336 | 32.48 |
| 45013.28125 | 32.45 |
| 45013.291666666664 | 32.48 |
| 45013.302083333336 | 32.47 |
| 45013.3125 | 32.45 |
| 45013.322916666664 | 32.43 |
| 45013.333333333336 | 32.4 |
| 45013.34375 | 32.38 |
| 45013.354166666664 | 32.39 |
| 45013.364583333336 | 32.35 |
| 45013.375 | 32.29 |
| 45013.385416666664 | 32.24 |
| 45013.395833333336 | 32.2 |
| 45013.40625 | 32.19 |
| 45013.416666666664 | 32.15 |
| 45013.427083333336 | 32.15 |
| 45013.4375 | 32.1 |
| 45013.447916666664 | 32.07 |
| 45013.458333333336 | 32.07 |
| 45013.46875 | 31.96 |
| 45013.479166666664 | 31.91 |
| 45013.489583333336 | 31.75 |
| 45013.5 | 31.7 |
| 45013.510416666664 | 31.57 |
| 45013.520833333336 | 31.54 |
| 45013.53125 | 31.48 |
| 45013.541666666664 | 31.48 |
| 45013.552083333336 | 31.5 |
| 45013.5625 | 31.57 |
| 45013.572916666664 | 31.61 |
| 45013.583333333336 | 31.65 |
| 45013.59375 | 31.71 |
| 45013.604166666664 | 31.8 |
| 45013.614583333336 | 31.9 |
| 45013.625 | 32.01 |
| 45013.635416666664 | 32.11 |
| 45013.645833333336 | 32.18 |
| 45013.65625 | 32.22 |
| 45013.666666666664 | 32.24 |
| 45013.677083333336 | 32.25 |
| 45013.6875 | 32.27 |
| 45013.697916666664 | 32.29 |
| 45013.708333333336 | 32.3 |
| 45013.71875 | 32.33 |
| 45013.729166666664 | 32.36 |
| 45013.739583333336 | 32.37 |
| 45013.75 | 32.4 |
| 45013.760416666664 | 32.41 |
| 45013.770833333336 | 32.41 |
| 45013.78125 | 32.4 |
| 45013.791666666664 | 32.45 |
| 45013.802083333336 | 32.44 |
| 45013.8125 | 32.4 |
| 45013.822916666664 | 32.39 |
| 45013.833333333336 | 32.41 |
| 45013.84375 | 32.39 |
| 45013.854166666664 | 32.36 |
| 45013.864583333336 | 32.36 |
| 45013.875 | 32.33 |
| 45013.885416666664 | 32.29 |
| 45013.895833333336 | 32.21 |
| 45013.90625 | 32.12 |
| 45013.916666666664 | 32.16 |
| 45013.927083333336 | 32.12 |
| 45013.9375 | 31.91 |
| 45013.947916666664 | 31.89 |
| 45013.958333333336 | 31.83 |
| 45013.96875 | 31.79 |
| 45013.979166666664 | 31.78 |
| 45013.989583333336 | 31.71 |
| 45014.0 | 31.62 |
| 45014.010416666664 | 31.56 |
| 45014.020833333336 | 31.51 |
| 45014.03125 | 31.45 |
| 45014.041666666664 | 31.42 |
| 45014.052083333336 | 31.42 |
| 45014.0625 | 31.45 |
| 45014.072916666664 | 31.53 |
| 45014.083333333336 | 31.57 |
| 45014.09375 | 31.58 |
| 45014.104166666664 | 31.66 |
| 45014.114583333336 | 31.76 |
| 45014.125 | 31.84 |
| 45014.135416666664 | 31.98 |
| 45014.145833333336 | 32.09 |
| 45014.15625 | 32.18 |
| 45014.166666666664 | 32.26 |
| 45014.177083333336 | 32.29 |
| 45014.1875 | 32.33 |
| 45014.197916666664 | 32.37 |
| 45014.208333333336 | 32.36 |
| 45014.21875 | 32.38 |
| 45014.229166666664 | 32.4 |
| 45014.239583333336 | 32.41 |
| 45014.25 | 32.42 |
| 45014.260416666664 | 32.42 |
| 45014.270833333336 | 32.41 |
| 45014.28125 | 32.42 |
| 45014.291666666664 | 32.43 |
| 45014.302083333336 | 32.43 |
| 45014.3125 | 32.38 |
| 45014.322916666664 | 32.4 |
| 45014.333333333336 | 32.39 |
| 45014.34375 | 32.37 |
| 45014.354166666664 | 32.37 |
| 45014.364583333336 | 32.36 |
| 45014.375 | 32.3 |
| 45014.385416666664 | 32.25 |
| 45014.395833333336 | 32.31 |
| 45014.40625 | 32.25 |
| 45014.416666666664 | 32.25 |
| 45014.427083333336 | 32.17 |
| 45014.4375 | 32.14 |
| 45014.447916666664 | 32.04 |
| 45014.458333333336 | 32 |
| 45014.46875 | 31.95 |
| 45014.479166666664 | 31.91 |
| 45014.489583333336 | 31.84 |
| 45014.5 | 31.71 |
| 45014.510416666664 | 31.67 |
| 45014.520833333336 | 31.59 |
| 45014.53125 | 31.48 |
| 45014.541666666664 | 31.37 |
| 45014.552083333336 | 31.31 |
| 45014.5625 | 31.28 |
| 45014.572916666664 | 31.26 |
| 45014.583333333336 | 31.28 |
| 45014.59375 | 31.29 |
| 45014.604166666664 | 31.37 |
| 45014.614583333336 | 31.4 |
| 45014.625 | 31.45 |
| 45014.635416666664 | 31.48 |
| 45014.645833333336 | 31.55 |
| 45014.65625 | 31.66 |
| 45014.666666666664 | 31.69 |
| 45014.677083333336 | 31.81 |
| 45014.6875 | 31.9 |
| 45014.697916666664 | 31.98 |
| 45014.708333333336 | 32.03 |
| 45014.71875 | 32.1 |
| 45014.729166666664 | 32.12 |
| 45014.739583333336 | 32.12 |
| 45014.75 | 32.15 |
| 45014.760416666664 | 32.15 |
| 45014.770833333336 | 32.17 |
| 45014.78125 | 32.18 |
| 45014.791666666664 | 32.18 |
| 45014.802083333336 | 32.19 |
| 45014.8125 | 32.17 |
| 45014.822916666664 | 32.19 |
| 45014.833333333336 | 32.06 |
| 45014.84375 | 32.06 |
| 45014.854166666664 | 32.15 |
| 45014.864583333336 | 32.1 |
| 45014.875 | 32.22 |
| 45014.885416666664 | 32.15 |
| 45014.895833333336 | 32.17 |
| 45014.90625 | 32.13 |
| 45014.916666666664 | 32.1 |
| 45014.927083333336 | 32.05 |
| 45014.9375 | 32.03 |
| 45014.947916666664 | 32.06 |
| 45014.958333333336 | 32.05 |
| 45014.96875 | 32.08 |
| 45014.979166666664 | 31.9 |
| 45014.989583333336 | 31.86 |
| 45015.0 | 31.84 |
| 45015.010416666664 | 31.76 |
| 45015.020833333336 | 31.68 |
| 45015.03125 | 31.63 |
| 45015.041666666664 | 31.63 |
| 45015.052083333336 | 31.61 |
| 45015.0625 | 31.6 |
| 45015.072916666664 | 31.63 |
| 45015.083333333336 | 31.66 |
| 45015.09375 | 31.68 |
| 45015.104166666664 | 31.69 |
| 45015.114583333336 | 31.74 |
| 45015.125 | 31.83 |
| 45015.135416666664 | 31.95 |
| 45015.145833333336 | 32.09 |
| 45015.15625 | 32.17 |
| 45015.166666666664 | 32.22 |
| 45015.177083333336 | 32.25 |
| 45015.1875 | 32.27 |
| 45015.197916666664 | 32.3 |
| 45015.208333333336 | 32.31 |
| 45015.21875 | 32.35 |
| 45015.229166666664 | 32.35 |
| 45015.239583333336 | 32.37 |
| 45015.25 | 32.39 |
| 45015.260416666664 | 32.4 |
| 45015.270833333336 | 32.41 |
| 45015.28125 | 32.43 |
| 45015.291666666664 | 32.46 |
| 45015.302083333336 | 32.47 |
| 45015.3125 | 32.49 |
| 45015.322916666664 | 32.5 |
| 45015.333333333336 | 32.5 |
| 45015.34375 | 32.51 |
| 45015.354166666664 | 32.46 |
| 45015.364583333336 | 32.48 |
| 45015.375 | 32.46 |
| 45015.385416666664 | 32.45 |
| 45015.395833333336 | 32.44 |
| 45015.40625 | 32.42 |
| 45015.416666666664 | 32.43 |
| 45015.427083333336 | 32.44 |
| 45015.4375 | 32.34 |
| 45015.447916666664 | 32.38 |
| 45015.458333333336 | 32.32 |
| 45015.46875 | 32.34 |
| 45015.479166666664 | 32.24 |
| 45015.489583333336 | 32.18 |
| 45015.5 | 32.11 |
| 45015.510416666664 | 32.09 |
| 45015.520833333336 | 32 |
| 45015.53125 | 31.88 |
| 45015.541666666664 | 31.73 |
| 45015.552083333336 | 31.55 |
| 45015.5625 | 31.48 |
| 45015.572916666664 | 31.44 |
| 45015.583333333336 | 31.42 |
| 45015.59375 | 31.41 |
| 45015.604166666664 | 31.4 |
| 45015.614583333336 | 31.4 |
| 45015.625 | 31.4 |
| 45015.635416666664 | 31.4 |
| 45015.645833333336 | 31.48 |
| 45015.65625 | 31.54 |
| 45015.666666666664 | 31.59 |
| 45015.677083333336 | 31.63 |
| 45015.6875 | 31.8 |
| 45015.697916666664 | 31.87 |
| 45015.708333333336 | 32.04 |
| 45015.71875 | 32.18 |
| 45015.729166666664 | 32.24 |
| 45015.739583333336 | 32.29 |
| 45015.75 | 32.31 |
| 45015.760416666664 | 32.32 |
| 45015.770833333336 | 32.34 |
| 45015.78125 | 32.37 |
| 45015.791666666664 | 32.39 |
| 45015.802083333336 | 32.39 |
| 45015.8125 | 32.41 |
| 45015.822916666664 | 32.42 |
| 45015.833333333336 | 32.43 |
| 45015.84375 | 32.44 |
| 45015.854166666664 | 32.44 |
| 45015.864583333336 | 32.43 |
| 45015.875 | 32.42 |
| 45015.885416666664 | 32.44 |
| 45015.895833333336 | 32.46 |
| 45015.90625 | 32.47 |
| 45015.916666666664 | 32.46 |
| 45015.927083333336 | 32.45 |
| 45015.9375 | 32.22 |
| 45015.947916666664 | 32.25 |
| 45015.958333333336 | 32.25 |
| 45015.96875 | 32.27 |
| 45015.979166666664 | 32.27 |
| 45015.989583333336 | 32.3 |
| 45016.0 | 32.3 |
| 45016.010416666664 | 32.22 |
| 45016.020833333336 | 32.18 |
| 45016.03125 | 32.13 |
| 45016.041666666664 | 32.05 |
| 45016.052083333336 | 31.9 |
| 45016.0625 | 31.81 |
| 45016.072916666664 | 31.74 |
| 45016.083333333336 | 31.64 |
| 45016.09375 | 31.59 |
| 45016.104166666664 | 31.51 |
| 45016.114583333336 | 31.5 |
| 45016.125 | 31.47 |
| 45016.135416666664 | 31.51 |
| 45016.145833333336 | 31.61 |
| 45016.15625 | 31.69 |
| 45016.166666666664 | 31.78 |
| 45016.177083333336 | 31.84 |
| 45016.1875 | 31.95 |
| 45016.197916666664 | 32.05 |
| 45016.208333333336 | 32.17 |
| 45016.21875 | 32.27 |
| 45016.229166666664 | 32.31 |
| 45016.239583333336 | 32.33 |
| 45016.25 | 32.35 |
| 45016.260416666664 | 32.39 |
| 45016.270833333336 | 32.41 |
| 45016.28125 | 32.46 |
| 45016.291666666664 | 32.48 |
| 45016.302083333336 | 32.5 |
| 45016.3125 | 32.53 |
| 45016.322916666664 | 32.56 |
| 45016.333333333336 | 32.59 |
| 45016.34375 | 32.6 |
| 45016.354166666664 | 32.62 |
| 45016.364583333336 | 32.63 |
| 45016.375 | 32.64 |
| 45016.385416666664 | 32.63 |
| 45016.395833333336 | 32.64 |
| 45016.40625 | 32.48 |
| 45016.416666666664 | 32.49 |
| 45016.427083333336 | 32.61 |
| 45016.4375 | 32.67 |
| 45016.447916666664 | 32.66 |
| 45016.458333333336 | 32.6 |
| 45016.46875 | 32.55 |
| 45016.479166666664 | 32.57 |
| 45016.489583333336 | 32.52 |
| 45016.5 | 32.57 |
| 45016.510416666664 | 32.42 |
| 45016.520833333336 | 32.39 |
| 45016.53125 | 32.31 |
| 45016.541666666664 | 32.15 |
| 45016.552083333336 | 32 |
| 45016.5625 | 31.84 |
| 45016.572916666664 | 31.76 |
| 45016.583333333336 | 31.73 |
| 45016.59375 | 31.71 |
| 45016.604166666664 | 31.71 |
| 45016.614583333336 | 31.72 |
| 45016.625 | 31.73 |
| 45016.635416666664 | 31.75 |
| 45016.645833333336 | 31.74 |
| 45016.65625 | 31.75 |
| 45016.666666666664 | 31.75 |
| 45016.677083333336 | 31.76 |
| 45016.6875 | 31.77 |
| 45016.697916666664 | 31.76 |
| 45016.708333333336 | 31.87 |
| 45016.71875 | 31.93 |
| 45016.729166666664 | 32.12 |
| 45016.739583333336 | 32.32 |
| 45016.75 | 32.54 |
| 45016.760416666664 | 32.62 |
| 45016.770833333336 | 32.62 |
| 45016.78125 | 32.69 |
| 45016.791666666664 | 32.74 |
| 45016.802083333336 | 32.8 |
| 45016.8125 | 32.89 |
| 45016.822916666664 | 32.96 |
| 45016.833333333336 | 33.02 |
| 45016.84375 | 33.07 |
| 45016.854166666664 | 33.08 |
| 45016.864583333336 | 33.1 |
| 45016.875 | 33.11 |
| 45016.885416666664 | 33.1 |
| 45016.895833333336 | 33.11 |
| 45016.90625 | 33.11 |
| 45016.916666666664 | 33.09 |
| 45016.927083333336 | 33.04 |
| 45016.9375 | 33.01 |
| 45016.947916666664 | 33.01 |
| 45016.958333333336 | 32.92 |
| 45016.96875 | 32.95 |
| 45016.979166666664 | 32.94 |
| 45016.989583333336 | 32.89 |
| 45017.0 | 32.92 |
| 45017.010416666664 | 33 |
| 45017.020833333336 | 33 |
| 45017.03125 | 32.98 |
| 45017.041666666664 | 32.83 |
| 45017.052083333336 | 32.56 |
| 45017.0625 | 32.4 |
| 45017.072916666664 | 32.3 |
| 45017.083333333336 | 32.24 |
| 45017.09375 | 32.19 |
| 45017.104166666664 | 32.08 |
| 45017.114583333336 | 31.95 |
| 45017.125 | 31.87 |
| 45017.135416666664 | 31.87 |
| 45017.145833333336 | 31.97 |